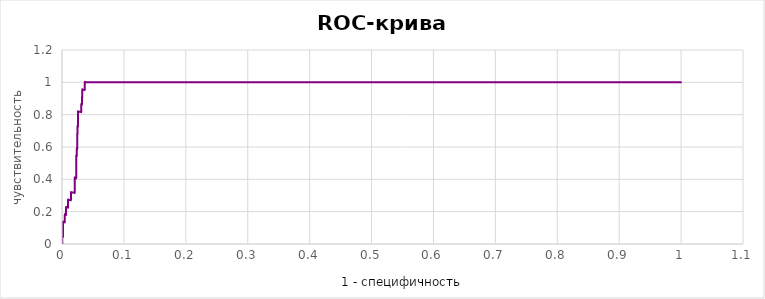
| Category | Series 0 |
|---|---|
| 0.00026595744680846245 | 0 |
| 0.0005319148936170359 | 0 |
| 0.0005319148936170359 | 0.045 |
| 0.0007978723404254984 | 0.045 |
| 0.0010638297872340718 | 0.045 |
| 0.0013297872340425343 | 0.045 |
| 0.0015957446808511078 | 0.045 |
| 0.0015957446808511078 | 0.091 |
| 0.0015957446808511078 | 0.136 |
| 0.0018617021276595702 | 0.136 |
| 0.0021276595744680327 | 0.136 |
| 0.002393617021276606 | 0.136 |
| 0.0026595744680850686 | 0.136 |
| 0.002925531914893642 | 0.136 |
| 0.0031914893617021045 | 0.136 |
| 0.003457446808510678 | 0.136 |
| 0.0037234042553191404 | 0.136 |
| 0.003989361702127714 | 0.136 |
| 0.004255319148936176 | 0.136 |
| 0.004521276595744639 | 0.136 |
| 0.004521276595744639 | 0.182 |
| 0.004787234042553212 | 0.182 |
| 0.005053191489361675 | 0.182 |
| 0.005319148936170248 | 0.182 |
| 0.005585106382978711 | 0.182 |
| 0.005851063829787284 | 0.182 |
| 0.006117021276595747 | 0.182 |
| 0.006382978723404209 | 0.182 |
| 0.0066489361702127825 | 0.182 |
| 0.0066489361702127825 | 0.227 |
| 0.006914893617021245 | 0.227 |
| 0.007180851063829818 | 0.227 |
| 0.007446808510638281 | 0.227 |
| 0.007712765957446854 | 0.227 |
| 0.007978723404255317 | 0.227 |
| 0.00824468085106378 | 0.227 |
| 0.008510638297872353 | 0.227 |
| 0.008776595744680815 | 0.227 |
| 0.009042553191489389 | 0.227 |
| 0.009308510638297851 | 0.227 |
| 0.009574468085106425 | 0.227 |
| 0.009840425531914887 | 0.227 |
| 0.009840425531914887 | 0.273 |
| 0.01010638297872335 | 0.273 |
| 0.010372340425531923 | 0.273 |
| 0.010638297872340385 | 0.273 |
| 0.010904255319148959 | 0.273 |
| 0.011170212765957421 | 0.273 |
| 0.011436170212765995 | 0.273 |
| 0.011702127659574457 | 0.273 |
| 0.01196808510638303 | 0.273 |
| 0.012234042553191493 | 0.273 |
| 0.012499999999999956 | 0.273 |
| 0.012765957446808529 | 0.273 |
| 0.013031914893616992 | 0.273 |
| 0.013297872340425565 | 0.273 |
| 0.013563829787234027 | 0.273 |
| 0.013829787234042601 | 0.273 |
| 0.014095744680851063 | 0.273 |
| 0.014361702127659526 | 0.273 |
| 0.014361702127659526 | 0.318 |
| 0.0146276595744681 | 0.318 |
| 0.014893617021276562 | 0.318 |
| 0.015159574468085135 | 0.318 |
| 0.015425531914893598 | 0.318 |
| 0.01569148936170217 | 0.318 |
| 0.015957446808510634 | 0.318 |
| 0.016223404255319096 | 0.318 |
| 0.01648936170212767 | 0.318 |
| 0.016755319148936132 | 0.318 |
| 0.017021276595744705 | 0.318 |
| 0.017287234042553168 | 0.318 |
| 0.01755319148936174 | 0.318 |
| 0.017819148936170204 | 0.318 |
| 0.018085106382978777 | 0.318 |
| 0.01835106382978724 | 0.318 |
| 0.018617021276595702 | 0.318 |
| 0.018882978723404276 | 0.318 |
| 0.019148936170212738 | 0.318 |
| 0.01941489361702131 | 0.318 |
| 0.019680851063829774 | 0.318 |
| 0.019946808510638347 | 0.318 |
| 0.02021276595744681 | 0.318 |
| 0.020478723404255272 | 0.318 |
| 0.020478723404255272 | 0.364 |
| 0.020478723404255272 | 0.409 |
| 0.020744680851063846 | 0.409 |
| 0.02101063829787231 | 0.409 |
| 0.021276595744680882 | 0.409 |
| 0.021542553191489344 | 0.409 |
| 0.021808510638297918 | 0.409 |
| 0.02207446808510638 | 0.409 |
| 0.022340425531914843 | 0.409 |
| 0.022606382978723416 | 0.409 |
| 0.02287234042553188 | 0.409 |
| 0.02287234042553188 | 0.455 |
| 0.02287234042553188 | 0.5 |
| 0.02287234042553188 | 0.545 |
| 0.023138297872340452 | 0.545 |
| 0.023404255319148914 | 0.545 |
| 0.023670212765957488 | 0.545 |
| 0.02393617021276595 | 0.545 |
| 0.02393617021276595 | 0.591 |
| 0.024202127659574413 | 0.591 |
| 0.024468085106382986 | 0.591 |
| 0.02473404255319145 | 0.591 |
| 0.02473404255319145 | 0.636 |
| 0.02473404255319145 | 0.682 |
| 0.025000000000000022 | 0.682 |
| 0.025000000000000022 | 0.727 |
| 0.025265957446808485 | 0.727 |
| 0.025531914893617058 | 0.727 |
| 0.02579787234042552 | 0.727 |
| 0.02579787234042552 | 0.773 |
| 0.02579787234042552 | 0.818 |
| 0.026063829787234094 | 0.818 |
| 0.026329787234042556 | 0.818 |
| 0.02659574468085102 | 0.818 |
| 0.026861702127659592 | 0.818 |
| 0.027127659574468055 | 0.818 |
| 0.02739361702127663 | 0.818 |
| 0.02765957446808509 | 0.818 |
| 0.027925531914893664 | 0.818 |
| 0.028191489361702127 | 0.818 |
| 0.02845744680851059 | 0.818 |
| 0.028723404255319163 | 0.818 |
| 0.028989361702127625 | 0.818 |
| 0.0292553191489362 | 0.818 |
| 0.02952127659574466 | 0.818 |
| 0.029787234042553234 | 0.818 |
| 0.030053191489361697 | 0.818 |
| 0.03031914893617016 | 0.818 |
| 0.030585106382978733 | 0.818 |
| 0.030851063829787195 | 0.818 |
| 0.03111702127659577 | 0.818 |
| 0.03111702127659577 | 0.864 |
| 0.03138297872340423 | 0.864 |
| 0.031648936170212805 | 0.864 |
| 0.03191489361702127 | 0.864 |
| 0.03218085106382984 | 0.864 |
| 0.03218085106382984 | 0.909 |
| 0.0324468085106383 | 0.909 |
| 0.032712765957446766 | 0.909 |
| 0.032712765957446766 | 0.955 |
| 0.03297872340425534 | 0.955 |
| 0.0332446808510638 | 0.955 |
| 0.033510638297872375 | 0.955 |
| 0.03377659574468084 | 0.955 |
| 0.03404255319148941 | 0.955 |
| 0.03430851063829787 | 0.955 |
| 0.034574468085106336 | 0.955 |
| 0.03484042553191491 | 0.955 |
| 0.03510638297872337 | 0.955 |
| 0.035372340425531945 | 0.955 |
| 0.03563829787234041 | 0.955 |
| 0.03590425531914898 | 0.955 |
| 0.036170212765957444 | 0.955 |
| 0.036436170212765906 | 0.955 |
| 0.03670212765957448 | 0.955 |
| 0.03670212765957448 | 1 |
| 0.03696808510638294 | 1 |
| 0.037234042553191515 | 1 |
| 0.03749999999999998 | 1 |
| 0.03776595744680855 | 1 |
| 0.038031914893617014 | 1 |
| 0.03829787234042559 | 1 |
| 0.03856382978723405 | 1 |
| 0.03882978723404251 | 1 |
| 0.039095744680851086 | 1 |
| 0.03936170212765955 | 1 |
| 0.03962765957446812 | 1 |
| 0.039893617021276584 | 1 |
| 0.04015957446808516 | 1 |
| 0.04042553191489362 | 1 |
| 0.04069148936170208 | 1 |
| 0.040957446808510656 | 1 |
| 0.04122340425531912 | 1 |
| 0.04148936170212769 | 1 |
| 0.041755319148936154 | 1 |
| 0.04202127659574473 | 1 |
| 0.04228723404255319 | 1 |
| 0.04255319148936165 | 1 |
| 0.042819148936170226 | 1 |
| 0.04308510638297869 | 1 |
| 0.04335106382978726 | 1 |
| 0.043617021276595724 | 1 |
| 0.0438829787234043 | 1 |
| 0.04414893617021276 | 1 |
| 0.04441489361702122 | 1 |
| 0.044680851063829796 | 1 |
| 0.04494680851063826 | 1 |
| 0.04521276595744683 | 1 |
| 0.045478723404255295 | 1 |
| 0.04574468085106387 | 1 |
| 0.04601063829787233 | 1 |
| 0.046276595744680904 | 1 |
| 0.046542553191489366 | 1 |
| 0.04680851063829783 | 1 |
| 0.0470744680851064 | 1 |
| 0.047340425531914865 | 1 |
| 0.04760638297872344 | 1 |
| 0.0478723404255319 | 1 |
| 0.048138297872340474 | 1 |
| 0.04840425531914894 | 1 |
| 0.0486702127659574 | 1 |
| 0.04893617021276597 | 1 |
| 0.049202127659574435 | 1 |
| 0.04946808510638301 | 1 |
| 0.04973404255319147 | 1 |
| 0.050000000000000044 | 1 |
| 0.05026595744680851 | 1 |
| 0.05053191489361697 | 1 |
| 0.05079787234042554 | 1 |
| 0.051063829787234005 | 1 |
| 0.05132978723404258 | 1 |
| 0.05159574468085104 | 1 |
| 0.051861702127659615 | 1 |
| 0.05212765957446808 | 1 |
| 0.05239361702127665 | 1 |
| 0.05265957446808511 | 1 |
| 0.052925531914893575 | 1 |
| 0.05319148936170215 | 1 |
| 0.05345744680851061 | 1 |
| 0.053723404255319185 | 1 |
| 0.05398936170212765 | 1 |
| 0.05425531914893622 | 1 |
| 0.05452127659574468 | 1 |
| 0.054787234042553146 | 1 |
| 0.05505319148936172 | 1 |
| 0.05531914893617018 | 1 |
| 0.055585106382978755 | 1 |
| 0.05585106382978722 | 1 |
| 0.05611702127659579 | 1 |
| 0.05638297872340425 | 1 |
| 0.056648936170212716 | 1 |
| 0.05691489361702129 | 1 |
| 0.05718085106382975 | 1 |
| 0.057446808510638325 | 1 |
| 0.05771276595744679 | 1 |
| 0.05797872340425536 | 1 |
| 0.058244680851063824 | 1 |
| 0.058510638297872286 | 1 |
| 0.05877659574468086 | 1 |
| 0.05904255319148932 | 1 |
| 0.059308510638297895 | 1 |
| 0.05957446808510636 | 1 |
| 0.05984042553191493 | 1 |
| 0.060106382978723394 | 1 |
| 0.06037234042553197 | 1 |
| 0.06063829787234043 | 1 |
| 0.06090425531914889 | 1 |
| 0.061170212765957466 | 1 |
| 0.06143617021276593 | 1 |
| 0.0617021276595745 | 1 |
| 0.061968085106382964 | 1 |
| 0.06223404255319154 | 1 |
| 0.0625 | 1 |
| 0.06276595744680846 | 1 |
| 0.06303191489361704 | 1 |
| 0.0632978723404255 | 1 |
| 0.06356382978723407 | 1 |
| 0.06382978723404253 | 1 |
| 0.06409574468085111 | 1 |
| 0.06436170212765957 | 1 |
| 0.06462765957446803 | 1 |
| 0.0648936170212766 | 1 |
| 0.06515957446808507 | 1 |
| 0.06542553191489364 | 1 |
| 0.0656914893617021 | 1 |
| 0.06595744680851068 | 1 |
| 0.06622340425531914 | 1 |
| 0.06648936170212771 | 1 |
| 0.06675531914893618 | 1 |
| 0.06702127659574464 | 1 |
| 0.06728723404255321 | 1 |
| 0.06755319148936167 | 1 |
| 0.06781914893617025 | 1 |
| 0.06808510638297871 | 1 |
| 0.06835106382978728 | 1 |
| 0.06861702127659575 | 1 |
| 0.06888297872340421 | 1 |
| 0.06914893617021278 | 1 |
| 0.06941489361702124 | 1 |
| 0.06968085106382982 | 1 |
| 0.06994680851063828 | 1 |
| 0.07021276595744685 | 1 |
| 0.07047872340425532 | 1 |
| 0.07074468085106378 | 1 |
| 0.07101063829787235 | 1 |
| 0.07127659574468082 | 1 |
| 0.07154255319148939 | 1 |
| 0.07180851063829785 | 1 |
| 0.07207446808510642 | 1 |
| 0.07234042553191489 | 1 |
| 0.07260638297872335 | 1 |
| 0.07287234042553192 | 1 |
| 0.07313829787234039 | 1 |
| 0.07340425531914896 | 1 |
| 0.07367021276595742 | 1 |
| 0.073936170212766 | 1 |
| 0.07420212765957446 | 1 |
| 0.07446808510638303 | 1 |
| 0.0747340425531915 | 1 |
| 0.07499999999999996 | 1 |
| 0.07526595744680853 | 1 |
| 0.07553191489361699 | 1 |
| 0.07579787234042556 | 1 |
| 0.07606382978723403 | 1 |
| 0.0763297872340426 | 1 |
| 0.07659574468085106 | 1 |
| 0.07686170212765953 | 1 |
| 0.0771276595744681 | 1 |
| 0.07739361702127656 | 1 |
| 0.07765957446808514 | 1 |
| 0.0779255319148936 | 1 |
| 0.07819148936170217 | 1 |
| 0.07845744680851063 | 1 |
| 0.0787234042553191 | 1 |
| 0.07898936170212767 | 1 |
| 0.07925531914893613 | 1 |
| 0.0795212765957447 | 1 |
| 0.07978723404255317 | 1 |
| 0.08005319148936174 | 1 |
| 0.0803191489361702 | 1 |
| 0.08058510638297878 | 1 |
| 0.08085106382978724 | 1 |
| 0.0811170212765957 | 1 |
| 0.08138297872340428 | 1 |
| 0.08164893617021274 | 1 |
| 0.08191489361702131 | 1 |
| 0.08218085106382977 | 1 |
| 0.08244680851063835 | 1 |
| 0.08271276595744681 | 1 |
| 0.08297872340425527 | 1 |
| 0.08324468085106385 | 1 |
| 0.08351063829787231 | 1 |
| 0.08377659574468088 | 1 |
| 0.08404255319148934 | 1 |
| 0.08430851063829792 | 1 |
| 0.08457446808510638 | 1 |
| 0.08484042553191484 | 1 |
| 0.08510638297872342 | 1 |
| 0.08537234042553188 | 1 |
| 0.08563829787234045 | 1 |
| 0.08590425531914891 | 1 |
| 0.08617021276595749 | 1 |
| 0.08643617021276595 | 1 |
| 0.08670212765957441 | 1 |
| 0.08696808510638299 | 1 |
| 0.08723404255319145 | 1 |
| 0.08750000000000002 | 1 |
| 0.08776595744680848 | 1 |
| 0.08803191489361706 | 1 |
| 0.08829787234042552 | 1 |
| 0.0885638297872341 | 1 |
| 0.08882978723404256 | 1 |
| 0.08909574468085102 | 1 |
| 0.08936170212765959 | 1 |
| 0.08962765957446805 | 1 |
| 0.08989361702127663 | 1 |
| 0.09015957446808509 | 1 |
| 0.09042553191489366 | 1 |
| 0.09069148936170213 | 1 |
| 0.09095744680851059 | 1 |
| 0.09122340425531916 | 1 |
| 0.09148936170212763 | 1 |
| 0.0917553191489362 | 1 |
| 0.09202127659574466 | 1 |
| 0.09228723404255323 | 1 |
| 0.0925531914893617 | 1 |
| 0.09281914893617016 | 1 |
| 0.09308510638297873 | 1 |
| 0.0933510638297872 | 1 |
| 0.09361702127659577 | 1 |
| 0.09388297872340423 | 1 |
| 0.0941489361702128 | 1 |
| 0.09441489361702127 | 1 |
| 0.09468085106382984 | 1 |
| 0.0949468085106383 | 1 |
| 0.09521276595744677 | 1 |
| 0.09547872340425534 | 1 |
| 0.0957446808510638 | 1 |
| 0.09601063829787237 | 1 |
| 0.09627659574468084 | 1 |
| 0.09654255319148941 | 1 |
| 0.09680851063829787 | 1 |
| 0.09707446808510634 | 1 |
| 0.09734042553191491 | 1 |
| 0.09760638297872337 | 1 |
| 0.09787234042553195 | 1 |
| 0.09813829787234041 | 1 |
| 0.09840425531914898 | 1 |
| 0.09867021276595744 | 1 |
| 0.0989361702127659 | 1 |
| 0.09920212765957448 | 1 |
| 0.09946808510638294 | 1 |
| 0.09973404255319152 | 1 |
| 0.09999999999999998 | 1 |
| 0.10026595744680855 | 1 |
| 0.10053191489361701 | 1 |
| 0.10079787234042559 | 1 |
| 0.10106382978723405 | 1 |
| 0.10132978723404251 | 1 |
| 0.10159574468085109 | 1 |
| 0.10186170212765955 | 1 |
| 0.10212765957446812 | 1 |
| 0.10239361702127658 | 1 |
| 0.10265957446808516 | 1 |
| 0.10292553191489362 | 1 |
| 0.10319148936170208 | 1 |
| 0.10345744680851066 | 1 |
| 0.10372340425531912 | 1 |
| 0.10398936170212769 | 1 |
| 0.10425531914893615 | 1 |
| 0.10452127659574473 | 1 |
| 0.10478723404255319 | 1 |
| 0.10505319148936165 | 1 |
| 0.10531914893617023 | 1 |
| 0.10558510638297869 | 1 |
| 0.10585106382978726 | 1 |
| 0.10611702127659572 | 1 |
| 0.1063829787234043 | 1 |
| 0.10664893617021276 | 1 |
| 0.10691489361702122 | 1 |
| 0.1071808510638298 | 1 |
| 0.10744680851063826 | 1 |
| 0.10771276595744683 | 1 |
| 0.1079787234042553 | 1 |
| 0.10824468085106387 | 1 |
| 0.10851063829787233 | 1 |
| 0.1087765957446809 | 1 |
| 0.10904255319148937 | 1 |
| 0.10930851063829783 | 1 |
| 0.1095744680851064 | 1 |
| 0.10984042553191486 | 1 |
| 0.11010638297872344 | 1 |
| 0.1103723404255319 | 1 |
| 0.11063829787234047 | 1 |
| 0.11090425531914894 | 1 |
| 0.1111702127659574 | 1 |
| 0.11143617021276597 | 1 |
| 0.11170212765957444 | 1 |
| 0.11196808510638301 | 1 |
| 0.11223404255319147 | 1 |
| 0.11250000000000004 | 1 |
| 0.1127659574468085 | 1 |
| 0.11303191489361697 | 1 |
| 0.11329787234042554 | 1 |
| 0.113563829787234 | 1 |
| 0.11382978723404258 | 1 |
| 0.11409574468085104 | 1 |
| 0.11436170212765961 | 1 |
| 0.11462765957446808 | 1 |
| 0.11489361702127665 | 1 |
| 0.11515957446808511 | 1 |
| 0.11542553191489358 | 1 |
| 0.11569148936170215 | 1 |
| 0.11595744680851061 | 1 |
| 0.11622340425531918 | 1 |
| 0.11648936170212765 | 1 |
| 0.11675531914893622 | 1 |
| 0.11702127659574468 | 1 |
| 0.11728723404255315 | 1 |
| 0.11755319148936172 | 1 |
| 0.11781914893617018 | 1 |
| 0.11808510638297876 | 1 |
| 0.11835106382978722 | 1 |
| 0.11861702127659579 | 1 |
| 0.11888297872340425 | 1 |
| 0.11914893617021272 | 1 |
| 0.11941489361702129 | 1 |
| 0.11968085106382975 | 1 |
| 0.11994680851063833 | 1 |
| 0.12021276595744679 | 1 |
| 0.12047872340425536 | 1 |
| 0.12074468085106382 | 1 |
| 0.12101063829787229 | 1 |
| 0.12127659574468086 | 1 |
| 0.12154255319148932 | 1 |
| 0.1218085106382979 | 1 |
| 0.12207446808510636 | 1 |
| 0.12234042553191493 | 1 |
| 0.1226063829787234 | 1 |
| 0.12287234042553197 | 1 |
| 0.12313829787234043 | 1 |
| 0.12340425531914889 | 1 |
| 0.12367021276595747 | 1 |
| 0.12393617021276593 | 1 |
| 0.1242021276595745 | 1 |
| 0.12446808510638296 | 1 |
| 0.12473404255319154 | 1 |
| 0.125 | 1 |
| 0.12526595744680846 | 1 |
| 0.12553191489361704 | 1 |
| 0.1257978723404255 | 1 |
| 0.12606382978723407 | 1 |
| 0.12632978723404253 | 1 |
| 0.1265957446808511 | 1 |
| 0.12686170212765957 | 1 |
| 0.12712765957446803 | 1 |
| 0.1273936170212766 | 1 |
| 0.12765957446808507 | 1 |
| 0.12792553191489364 | 1 |
| 0.1281914893617021 | 1 |
| 0.12845744680851068 | 1 |
| 0.12872340425531914 | 1 |
| 0.12898936170212771 | 1 |
| 0.12925531914893618 | 1 |
| 0.12952127659574464 | 1 |
| 0.1297872340425532 | 1 |
| 0.13005319148936167 | 1 |
| 0.13031914893617025 | 1 |
| 0.1305851063829787 | 1 |
| 0.13085106382978728 | 1 |
| 0.13111702127659575 | 1 |
| 0.1313829787234042 | 1 |
| 0.13164893617021278 | 1 |
| 0.13191489361702124 | 1 |
| 0.13218085106382982 | 1 |
| 0.13244680851063828 | 1 |
| 0.13271276595744685 | 1 |
| 0.13297872340425532 | 1 |
| 0.13324468085106378 | 1 |
| 0.13351063829787235 | 1 |
| 0.13377659574468082 | 1 |
| 0.1340425531914894 | 1 |
| 0.13430851063829785 | 1 |
| 0.13457446808510642 | 1 |
| 0.1348404255319149 | 1 |
| 0.13510638297872335 | 1 |
| 0.13537234042553192 | 1 |
| 0.13563829787234039 | 1 |
| 0.13590425531914896 | 1 |
| 0.13617021276595742 | 1 |
| 0.136436170212766 | 1 |
| 0.13670212765957446 | 1 |
| 0.13696808510638303 | 1 |
| 0.1372340425531915 | 1 |
| 0.13749999999999996 | 1 |
| 0.13776595744680853 | 1 |
| 0.138031914893617 | 1 |
| 0.13829787234042556 | 1 |
| 0.13856382978723403 | 1 |
| 0.1388297872340426 | 1 |
| 0.13909574468085106 | 1 |
| 0.13936170212765953 | 1 |
| 0.1396276595744681 | 1 |
| 0.13989361702127656 | 1 |
| 0.14015957446808514 | 1 |
| 0.1404255319148936 | 1 |
| 0.14069148936170217 | 1 |
| 0.14095744680851063 | 1 |
| 0.1412234042553191 | 1 |
| 0.14148936170212767 | 1 |
| 0.14175531914893613 | 1 |
| 0.1420212765957447 | 1 |
| 0.14228723404255317 | 1 |
| 0.14255319148936174 | 1 |
| 0.1428191489361702 | 1 |
| 0.14308510638297878 | 1 |
| 0.14335106382978724 | 1 |
| 0.1436170212765957 | 1 |
| 0.14388297872340428 | 1 |
| 0.14414893617021274 | 1 |
| 0.1444148936170213 | 1 |
| 0.14468085106382977 | 1 |
| 0.14494680851063835 | 1 |
| 0.1452127659574468 | 1 |
| 0.14547872340425527 | 1 |
| 0.14574468085106385 | 1 |
| 0.1460106382978723 | 1 |
| 0.14627659574468088 | 1 |
| 0.14654255319148934 | 1 |
| 0.14680851063829792 | 1 |
| 0.14707446808510638 | 1 |
| 0.14734042553191484 | 1 |
| 0.14760638297872342 | 1 |
| 0.14787234042553188 | 1 |
| 0.14813829787234045 | 1 |
| 0.14840425531914891 | 1 |
| 0.1486702127659575 | 1 |
| 0.14893617021276595 | 1 |
| 0.1492021276595744 | 1 |
| 0.149468085106383 | 1 |
| 0.14973404255319145 | 1 |
| 0.15000000000000002 | 1 |
| 0.15026595744680848 | 1 |
| 0.15053191489361706 | 1 |
| 0.15079787234042552 | 1 |
| 0.1510638297872341 | 1 |
| 0.15132978723404256 | 1 |
| 0.15159574468085102 | 1 |
| 0.1518617021276596 | 1 |
| 0.15212765957446805 | 1 |
| 0.15239361702127663 | 1 |
| 0.1526595744680851 | 1 |
| 0.15292553191489366 | 1 |
| 0.15319148936170213 | 1 |
| 0.1534574468085106 | 1 |
| 0.15372340425531916 | 1 |
| 0.15398936170212763 | 1 |
| 0.1542553191489362 | 1 |
| 0.15452127659574466 | 1 |
| 0.15478723404255323 | 1 |
| 0.1550531914893617 | 1 |
| 0.15531914893617016 | 1 |
| 0.15558510638297873 | 1 |
| 0.1558510638297872 | 1 |
| 0.15611702127659577 | 1 |
| 0.15638297872340423 | 1 |
| 0.1566489361702128 | 1 |
| 0.15691489361702127 | 1 |
| 0.15718085106382984 | 1 |
| 0.1574468085106383 | 1 |
| 0.15771276595744677 | 1 |
| 0.15797872340425534 | 1 |
| 0.1582446808510638 | 1 |
| 0.15851063829787237 | 1 |
| 0.15877659574468084 | 1 |
| 0.1590425531914894 | 1 |
| 0.15930851063829787 | 1 |
| 0.15957446808510634 | 1 |
| 0.1598404255319149 | 1 |
| 0.16010638297872337 | 1 |
| 0.16037234042553195 | 1 |
| 0.1606382978723404 | 1 |
| 0.16090425531914898 | 1 |
| 0.16117021276595744 | 1 |
| 0.1614361702127659 | 1 |
| 0.16170212765957448 | 1 |
| 0.16196808510638294 | 1 |
| 0.16223404255319152 | 1 |
| 0.16249999999999998 | 1 |
| 0.16276595744680855 | 1 |
| 0.163031914893617 | 1 |
| 0.1632978723404256 | 1 |
| 0.16356382978723405 | 1 |
| 0.1638297872340425 | 1 |
| 0.16409574468085109 | 1 |
| 0.16436170212765955 | 1 |
| 0.16462765957446812 | 1 |
| 0.16489361702127658 | 1 |
| 0.16515957446808516 | 1 |
| 0.16542553191489362 | 1 |
| 0.16569148936170208 | 1 |
| 0.16595744680851066 | 1 |
| 0.16622340425531912 | 1 |
| 0.1664893617021277 | 1 |
| 0.16675531914893615 | 1 |
| 0.16702127659574473 | 1 |
| 0.1672872340425532 | 1 |
| 0.16755319148936165 | 1 |
| 0.16781914893617023 | 1 |
| 0.1680851063829787 | 1 |
| 0.16835106382978726 | 1 |
| 0.16861702127659572 | 1 |
| 0.1688829787234043 | 1 |
| 0.16914893617021276 | 1 |
| 0.16941489361702122 | 1 |
| 0.1696808510638298 | 1 |
| 0.16994680851063826 | 1 |
| 0.17021276595744683 | 1 |
| 0.1704787234042553 | 1 |
| 0.17074468085106387 | 1 |
| 0.17101063829787233 | 1 |
| 0.1712765957446809 | 1 |
| 0.17154255319148937 | 1 |
| 0.17180851063829783 | 1 |
| 0.1720744680851064 | 1 |
| 0.17234042553191486 | 1 |
| 0.17260638297872344 | 1 |
| 0.1728723404255319 | 1 |
| 0.17313829787234047 | 1 |
| 0.17340425531914894 | 1 |
| 0.1736702127659574 | 1 |
| 0.17393617021276597 | 1 |
| 0.17420212765957444 | 1 |
| 0.174468085106383 | 1 |
| 0.17473404255319147 | 1 |
| 0.17500000000000004 | 1 |
| 0.1752659574468085 | 1 |
| 0.17553191489361697 | 1 |
| 0.17579787234042554 | 1 |
| 0.176063829787234 | 1 |
| 0.17632978723404258 | 1 |
| 0.17659574468085104 | 1 |
| 0.17686170212765961 | 1 |
| 0.17712765957446808 | 1 |
| 0.17739361702127665 | 1 |
| 0.1776595744680851 | 1 |
| 0.17792553191489358 | 1 |
| 0.17819148936170215 | 1 |
| 0.1784574468085106 | 1 |
| 0.17872340425531918 | 1 |
| 0.17898936170212765 | 1 |
| 0.17925531914893622 | 1 |
| 0.17952127659574468 | 1 |
| 0.17978723404255315 | 1 |
| 0.18005319148936172 | 1 |
| 0.18031914893617018 | 1 |
| 0.18058510638297876 | 1 |
| 0.18085106382978722 | 1 |
| 0.1811170212765958 | 1 |
| 0.18138297872340425 | 1 |
| 0.18164893617021272 | 1 |
| 0.1819148936170213 | 1 |
| 0.18218085106382975 | 1 |
| 0.18244680851063833 | 1 |
| 0.1827127659574468 | 1 |
| 0.18297872340425536 | 1 |
| 0.18324468085106382 | 1 |
| 0.18351063829787229 | 1 |
| 0.18377659574468086 | 1 |
| 0.18404255319148932 | 1 |
| 0.1843085106382979 | 1 |
| 0.18457446808510636 | 1 |
| 0.18484042553191493 | 1 |
| 0.1851063829787234 | 1 |
| 0.18537234042553197 | 1 |
| 0.18563829787234043 | 1 |
| 0.1859042553191489 | 1 |
| 0.18617021276595747 | 1 |
| 0.18643617021276593 | 1 |
| 0.1867021276595745 | 1 |
| 0.18696808510638296 | 1 |
| 0.18723404255319154 | 1 |
| 0.1875 | 1 |
| 0.18776595744680846 | 1 |
| 0.18803191489361704 | 1 |
| 0.1882978723404255 | 1 |
| 0.18856382978723407 | 1 |
| 0.18882978723404253 | 1 |
| 0.1890957446808511 | 1 |
| 0.18936170212765957 | 1 |
| 0.18962765957446803 | 1 |
| 0.1898936170212766 | 1 |
| 0.19015957446808507 | 1 |
| 0.19042553191489364 | 1 |
| 0.1906914893617021 | 1 |
| 0.19095744680851068 | 1 |
| 0.19122340425531914 | 1 |
| 0.19148936170212771 | 1 |
| 0.19175531914893618 | 1 |
| 0.19202127659574464 | 1 |
| 0.1922872340425532 | 1 |
| 0.19255319148936167 | 1 |
| 0.19281914893617025 | 1 |
| 0.1930851063829787 | 1 |
| 0.19335106382978728 | 1 |
| 0.19361702127659575 | 1 |
| 0.1938829787234042 | 1 |
| 0.19414893617021278 | 1 |
| 0.19441489361702124 | 1 |
| 0.19468085106382982 | 1 |
| 0.19494680851063828 | 1 |
| 0.19521276595744685 | 1 |
| 0.19547872340425532 | 1 |
| 0.19574468085106378 | 1 |
| 0.19601063829787235 | 1 |
| 0.19627659574468082 | 1 |
| 0.1965425531914894 | 1 |
| 0.19680851063829785 | 1 |
| 0.19707446808510642 | 1 |
| 0.1973404255319149 | 1 |
| 0.19760638297872335 | 1 |
| 0.19787234042553192 | 1 |
| 0.19813829787234039 | 1 |
| 0.19840425531914896 | 1 |
| 0.19867021276595742 | 1 |
| 0.198936170212766 | 1 |
| 0.19920212765957446 | 1 |
| 0.19946808510638303 | 1 |
| 0.1997340425531915 | 1 |
| 0.19999999999999996 | 1 |
| 0.20026595744680853 | 1 |
| 0.200531914893617 | 1 |
| 0.20079787234042556 | 1 |
| 0.20106382978723403 | 1 |
| 0.2013297872340426 | 1 |
| 0.20159574468085106 | 1 |
| 0.20186170212765953 | 1 |
| 0.2021276595744681 | 1 |
| 0.20239361702127656 | 1 |
| 0.20265957446808514 | 1 |
| 0.2029255319148936 | 1 |
| 0.20319148936170217 | 1 |
| 0.20345744680851063 | 1 |
| 0.2037234042553191 | 1 |
| 0.20398936170212767 | 1 |
| 0.20425531914893613 | 1 |
| 0.2045212765957447 | 1 |
| 0.20478723404255317 | 1 |
| 0.20505319148936174 | 1 |
| 0.2053191489361702 | 1 |
| 0.20558510638297878 | 1 |
| 0.20585106382978724 | 1 |
| 0.2061170212765957 | 1 |
| 0.20638297872340428 | 1 |
| 0.20664893617021274 | 1 |
| 0.2069148936170213 | 1 |
| 0.20718085106382977 | 1 |
| 0.20744680851063835 | 1 |
| 0.2077127659574468 | 1 |
| 0.20797872340425527 | 1 |
| 0.20824468085106385 | 1 |
| 0.2085106382978723 | 1 |
| 0.20877659574468088 | 1 |
| 0.20904255319148934 | 1 |
| 0.20930851063829792 | 1 |
| 0.20957446808510638 | 1 |
| 0.20984042553191484 | 1 |
| 0.21010638297872342 | 1 |
| 0.21037234042553188 | 1 |
| 0.21063829787234045 | 1 |
| 0.21090425531914891 | 1 |
| 0.2111702127659575 | 1 |
| 0.21143617021276595 | 1 |
| 0.2117021276595744 | 1 |
| 0.211968085106383 | 1 |
| 0.21223404255319145 | 1 |
| 0.21250000000000002 | 1 |
| 0.21276595744680848 | 1 |
| 0.21303191489361706 | 1 |
| 0.21329787234042552 | 1 |
| 0.2135638297872341 | 1 |
| 0.21382978723404256 | 1 |
| 0.21409574468085102 | 1 |
| 0.2143617021276596 | 1 |
| 0.21462765957446805 | 1 |
| 0.21489361702127663 | 1 |
| 0.2151595744680851 | 1 |
| 0.21542553191489366 | 1 |
| 0.21569148936170213 | 1 |
| 0.2159574468085106 | 1 |
| 0.21622340425531916 | 1 |
| 0.21648936170212763 | 1 |
| 0.2167553191489362 | 1 |
| 0.21702127659574466 | 1 |
| 0.21728723404255323 | 1 |
| 0.2175531914893617 | 1 |
| 0.21781914893617016 | 1 |
| 0.21808510638297873 | 1 |
| 0.2183510638297872 | 1 |
| 0.21861702127659577 | 1 |
| 0.21888297872340423 | 1 |
| 0.2191489361702128 | 1 |
| 0.21941489361702127 | 1 |
| 0.21968085106382984 | 1 |
| 0.2199468085106383 | 1 |
| 0.22021276595744677 | 1 |
| 0.22047872340425534 | 1 |
| 0.2207446808510638 | 1 |
| 0.22101063829787237 | 1 |
| 0.22127659574468084 | 1 |
| 0.2215425531914894 | 1 |
| 0.22180851063829787 | 1 |
| 0.22207446808510634 | 1 |
| 0.2223404255319149 | 1 |
| 0.22260638297872337 | 1 |
| 0.22287234042553195 | 1 |
| 0.2231382978723404 | 1 |
| 0.22340425531914898 | 1 |
| 0.22367021276595744 | 1 |
| 0.2239361702127659 | 1 |
| 0.22420212765957448 | 1 |
| 0.22446808510638294 | 1 |
| 0.22473404255319152 | 1 |
| 0.22499999999999998 | 1 |
| 0.22526595744680855 | 1 |
| 0.225531914893617 | 1 |
| 0.2257978723404256 | 1 |
| 0.22606382978723405 | 1 |
| 0.2263297872340425 | 1 |
| 0.22659574468085109 | 1 |
| 0.22686170212765955 | 1 |
| 0.22712765957446812 | 1 |
| 0.22739361702127658 | 1 |
| 0.22765957446808516 | 1 |
| 0.22792553191489362 | 1 |
| 0.22819148936170208 | 1 |
| 0.22845744680851066 | 1 |
| 0.22872340425531912 | 1 |
| 0.2289893617021277 | 1 |
| 0.22925531914893615 | 1 |
| 0.22952127659574473 | 1 |
| 0.2297872340425532 | 1 |
| 0.23005319148936165 | 1 |
| 0.23031914893617023 | 1 |
| 0.2305851063829787 | 1 |
| 0.23085106382978726 | 1 |
| 0.23111702127659572 | 1 |
| 0.2313829787234043 | 1 |
| 0.23164893617021276 | 1 |
| 0.23191489361702122 | 1 |
| 0.2321808510638298 | 1 |
| 0.23244680851063826 | 1 |
| 0.23271276595744683 | 1 |
| 0.2329787234042553 | 1 |
| 0.23324468085106387 | 1 |
| 0.23351063829787233 | 1 |
| 0.2337765957446809 | 1 |
| 0.23404255319148937 | 1 |
| 0.23430851063829783 | 1 |
| 0.2345744680851064 | 1 |
| 0.23484042553191486 | 1 |
| 0.23510638297872344 | 1 |
| 0.2353723404255319 | 1 |
| 0.23563829787234047 | 1 |
| 0.23590425531914894 | 1 |
| 0.2361702127659574 | 1 |
| 0.23643617021276597 | 1 |
| 0.23670212765957444 | 1 |
| 0.236968085106383 | 1 |
| 0.23723404255319147 | 1 |
| 0.23750000000000004 | 1 |
| 0.2377659574468085 | 1 |
| 0.23803191489361697 | 1 |
| 0.23829787234042554 | 1 |
| 0.238563829787234 | 1 |
| 0.23882978723404258 | 1 |
| 0.23909574468085104 | 1 |
| 0.23936170212765961 | 1 |
| 0.23962765957446808 | 1 |
| 0.23989361702127665 | 1 |
| 0.2401595744680851 | 1 |
| 0.24042553191489358 | 1 |
| 0.24069148936170215 | 1 |
| 0.2409574468085106 | 1 |
| 0.24122340425531918 | 1 |
| 0.24148936170212765 | 1 |
| 0.24175531914893622 | 1 |
| 0.24202127659574468 | 1 |
| 0.24228723404255315 | 1 |
| 0.24255319148936172 | 1 |
| 0.24281914893617018 | 1 |
| 0.24308510638297876 | 1 |
| 0.24335106382978722 | 1 |
| 0.2436170212765958 | 1 |
| 0.24388297872340425 | 1 |
| 0.24414893617021272 | 1 |
| 0.2444148936170213 | 1 |
| 0.24468085106382975 | 1 |
| 0.24494680851063833 | 1 |
| 0.2452127659574468 | 1 |
| 0.24547872340425536 | 1 |
| 0.24574468085106382 | 1 |
| 0.24601063829787229 | 1 |
| 0.24627659574468086 | 1 |
| 0.24654255319148932 | 1 |
| 0.2468085106382979 | 1 |
| 0.24707446808510636 | 1 |
| 0.24734042553191493 | 1 |
| 0.2476063829787234 | 1 |
| 0.24787234042553197 | 1 |
| 0.24813829787234043 | 1 |
| 0.2484042553191489 | 1 |
| 0.24867021276595747 | 1 |
| 0.24893617021276593 | 1 |
| 0.2492021276595745 | 1 |
| 0.24946808510638296 | 1 |
| 0.24973404255319154 | 1 |
| 0.25 | 1 |
| 0.25026595744680846 | 1 |
| 0.25053191489361704 | 1 |
| 0.2507978723404255 | 1 |
| 0.25106382978723407 | 1 |
| 0.25132978723404253 | 1 |
| 0.2515957446808511 | 1 |
| 0.25186170212765957 | 1 |
| 0.25212765957446803 | 1 |
| 0.2523936170212766 | 1 |
| 0.25265957446808507 | 1 |
| 0.25292553191489364 | 1 |
| 0.2531914893617021 | 1 |
| 0.2534574468085107 | 1 |
| 0.25372340425531914 | 1 |
| 0.2539893617021277 | 1 |
| 0.2542553191489362 | 1 |
| 0.25452127659574464 | 1 |
| 0.2547872340425532 | 1 |
| 0.2550531914893617 | 1 |
| 0.25531914893617025 | 1 |
| 0.2555851063829787 | 1 |
| 0.2558510638297873 | 1 |
| 0.25611702127659575 | 1 |
| 0.2563829787234042 | 1 |
| 0.2566489361702128 | 1 |
| 0.25691489361702124 | 1 |
| 0.2571808510638298 | 1 |
| 0.2574468085106383 | 1 |
| 0.25771276595744685 | 1 |
| 0.2579787234042553 | 1 |
| 0.2582446808510638 | 1 |
| 0.25851063829787235 | 1 |
| 0.2587765957446808 | 1 |
| 0.2590425531914894 | 1 |
| 0.25930851063829785 | 1 |
| 0.2595744680851064 | 1 |
| 0.2598404255319149 | 1 |
| 0.26010638297872335 | 1 |
| 0.2603723404255319 | 1 |
| 0.2606382978723404 | 1 |
| 0.26090425531914896 | 1 |
| 0.2611702127659574 | 1 |
| 0.261436170212766 | 1 |
| 0.26170212765957446 | 1 |
| 0.26196808510638303 | 1 |
| 0.2622340425531915 | 1 |
| 0.26249999999999996 | 1 |
| 0.26276595744680853 | 1 |
| 0.263031914893617 | 1 |
| 0.26329787234042556 | 1 |
| 0.263563829787234 | 1 |
| 0.2638297872340426 | 1 |
| 0.26409574468085106 | 1 |
| 0.2643617021276595 | 1 |
| 0.2646276595744681 | 1 |
| 0.26489361702127656 | 1 |
| 0.26515957446808514 | 1 |
| 0.2654255319148936 | 1 |
| 0.26569148936170217 | 1 |
| 0.26595744680851063 | 1 |
| 0.2662234042553191 | 1 |
| 0.26648936170212767 | 1 |
| 0.26675531914893613 | 1 |
| 0.2670212765957447 | 1 |
| 0.26728723404255317 | 1 |
| 0.26755319148936174 | 1 |
| 0.2678191489361702 | 1 |
| 0.2680851063829788 | 1 |
| 0.26835106382978724 | 1 |
| 0.2686170212765957 | 1 |
| 0.2688829787234043 | 1 |
| 0.26914893617021274 | 1 |
| 0.2694148936170213 | 1 |
| 0.2696808510638298 | 1 |
| 0.26994680851063835 | 1 |
| 0.2702127659574468 | 1 |
| 0.2704787234042553 | 1 |
| 0.27074468085106385 | 1 |
| 0.2710106382978723 | 1 |
| 0.2712765957446809 | 1 |
| 0.27154255319148934 | 1 |
| 0.2718085106382979 | 1 |
| 0.2720744680851064 | 1 |
| 0.27234042553191484 | 1 |
| 0.2726063829787234 | 1 |
| 0.2728723404255319 | 1 |
| 0.27313829787234045 | 1 |
| 0.2734042553191489 | 1 |
| 0.2736702127659575 | 1 |
| 0.27393617021276595 | 1 |
| 0.2742021276595744 | 1 |
| 0.274468085106383 | 1 |
| 0.27473404255319145 | 1 |
| 0.275 | 1 |
| 0.2752659574468085 | 1 |
| 0.27553191489361706 | 1 |
| 0.2757978723404255 | 1 |
| 0.2760638297872341 | 1 |
| 0.27632978723404256 | 1 |
| 0.276595744680851 | 1 |
| 0.2768617021276596 | 1 |
| 0.27712765957446805 | 1 |
| 0.27739361702127663 | 1 |
| 0.2776595744680851 | 1 |
| 0.27792553191489366 | 1 |
| 0.2781914893617021 | 1 |
| 0.2784574468085106 | 1 |
| 0.27872340425531916 | 1 |
| 0.2789893617021276 | 1 |
| 0.2792553191489362 | 1 |
| 0.27952127659574466 | 1 |
| 0.27978723404255323 | 1 |
| 0.2800531914893617 | 1 |
| 0.28031914893617016 | 1 |
| 0.28058510638297873 | 1 |
| 0.2808510638297872 | 1 |
| 0.28111702127659577 | 1 |
| 0.28138297872340423 | 1 |
| 0.2816489361702128 | 1 |
| 0.28191489361702127 | 1 |
| 0.28218085106382984 | 1 |
| 0.2824468085106383 | 1 |
| 0.28271276595744677 | 1 |
| 0.28297872340425534 | 1 |
| 0.2832446808510638 | 1 |
| 0.2835106382978724 | 1 |
| 0.28377659574468084 | 1 |
| 0.2840425531914894 | 1 |
| 0.2843085106382979 | 1 |
| 0.28457446808510634 | 1 |
| 0.2848404255319149 | 1 |
| 0.28510638297872337 | 1 |
| 0.28537234042553195 | 1 |
| 0.2856382978723404 | 1 |
| 0.285904255319149 | 1 |
| 0.28617021276595744 | 1 |
| 0.2864361702127659 | 1 |
| 0.2867021276595745 | 1 |
| 0.28696808510638294 | 1 |
| 0.2872340425531915 | 1 |
| 0.2875 | 1 |
| 0.28776595744680855 | 1 |
| 0.288031914893617 | 1 |
| 0.2882978723404256 | 1 |
| 0.28856382978723405 | 1 |
| 0.2888297872340425 | 1 |
| 0.2890957446808511 | 1 |
| 0.28936170212765955 | 1 |
| 0.2896276595744681 | 1 |
| 0.2898936170212766 | 1 |
| 0.29015957446808516 | 1 |
| 0.2904255319148936 | 1 |
| 0.2906914893617021 | 1 |
| 0.29095744680851066 | 1 |
| 0.2912234042553191 | 1 |
| 0.2914893617021277 | 1 |
| 0.29175531914893615 | 1 |
| 0.2920212765957447 | 1 |
| 0.2922872340425532 | 1 |
| 0.29255319148936165 | 1 |
| 0.2928191489361702 | 1 |
| 0.2930851063829787 | 1 |
| 0.29335106382978726 | 1 |
| 0.2936170212765957 | 1 |
| 0.2938829787234043 | 1 |
| 0.29414893617021276 | 1 |
| 0.2944148936170212 | 1 |
| 0.2946808510638298 | 1 |
| 0.29494680851063826 | 1 |
| 0.29521276595744683 | 1 |
| 0.2954787234042553 | 1 |
| 0.29574468085106387 | 1 |
| 0.29601063829787233 | 1 |
| 0.2962765957446809 | 1 |
| 0.29654255319148937 | 1 |
| 0.29680851063829783 | 1 |
| 0.2970744680851064 | 1 |
| 0.29734042553191486 | 1 |
| 0.29760638297872344 | 1 |
| 0.2978723404255319 | 1 |
| 0.2981382978723405 | 1 |
| 0.29840425531914894 | 1 |
| 0.2986702127659574 | 1 |
| 0.298936170212766 | 1 |
| 0.29920212765957444 | 1 |
| 0.299468085106383 | 1 |
| 0.29973404255319147 | 1 |
| 0.30000000000000004 | 1 |
| 0.3002659574468085 | 1 |
| 0.30053191489361697 | 1 |
| 0.30079787234042554 | 1 |
| 0.301063829787234 | 1 |
| 0.3013297872340426 | 1 |
| 0.30159574468085104 | 1 |
| 0.3018617021276596 | 1 |
| 0.3021276595744681 | 1 |
| 0.30239361702127665 | 1 |
| 0.3026595744680851 | 1 |
| 0.3029255319148936 | 1 |
| 0.30319148936170215 | 1 |
| 0.3034574468085106 | 1 |
| 0.3037234042553192 | 1 |
| 0.30398936170212765 | 1 |
| 0.3042553191489362 | 1 |
| 0.3045212765957447 | 1 |
| 0.30478723404255315 | 1 |
| 0.3050531914893617 | 1 |
| 0.3053191489361702 | 1 |
| 0.30558510638297876 | 1 |
| 0.3058510638297872 | 1 |
| 0.3061170212765958 | 1 |
| 0.30638297872340425 | 1 |
| 0.3066489361702127 | 1 |
| 0.3069148936170213 | 1 |
| 0.30718085106382975 | 1 |
| 0.3074468085106383 | 1 |
| 0.3077127659574468 | 1 |
| 0.30797872340425536 | 1 |
| 0.3082446808510638 | 1 |
| 0.3085106382978723 | 1 |
| 0.30877659574468086 | 1 |
| 0.3090425531914893 | 1 |
| 0.3093085106382979 | 1 |
| 0.30957446808510636 | 1 |
| 0.30984042553191493 | 1 |
| 0.3101063829787234 | 1 |
| 0.31037234042553197 | 1 |
| 0.31063829787234043 | 1 |
| 0.3109042553191489 | 1 |
| 0.31117021276595747 | 1 |
| 0.31143617021276593 | 1 |
| 0.3117021276595745 | 1 |
| 0.31196808510638296 | 1 |
| 0.31223404255319154 | 1 |
| 0.3125 | 1 |
| 0.31276595744680846 | 1 |
| 0.31303191489361704 | 1 |
| 0.3132978723404255 | 1 |
| 0.31356382978723407 | 1 |
| 0.31382978723404253 | 1 |
| 0.3140957446808511 | 1 |
| 0.31436170212765957 | 1 |
| 0.31462765957446803 | 1 |
| 0.3148936170212766 | 1 |
| 0.31515957446808507 | 1 |
| 0.31542553191489364 | 1 |
| 0.3156914893617021 | 1 |
| 0.3159574468085107 | 1 |
| 0.31622340425531914 | 1 |
| 0.3164893617021277 | 1 |
| 0.3167553191489362 | 1 |
| 0.31702127659574464 | 1 |
| 0.3172872340425532 | 1 |
| 0.3175531914893617 | 1 |
| 0.31781914893617025 | 1 |
| 0.3180851063829787 | 1 |
| 0.3183510638297873 | 1 |
| 0.31861702127659575 | 1 |
| 0.3188829787234042 | 1 |
| 0.3191489361702128 | 1 |
| 0.31941489361702124 | 1 |
| 0.3196808510638298 | 1 |
| 0.3199468085106383 | 1 |
| 0.32021276595744685 | 1 |
| 0.3204787234042553 | 1 |
| 0.3207446808510638 | 1 |
| 0.32101063829787235 | 1 |
| 0.3212765957446808 | 1 |
| 0.3215425531914894 | 1 |
| 0.32180851063829785 | 1 |
| 0.3220744680851064 | 1 |
| 0.3223404255319149 | 1 |
| 0.32260638297872335 | 1 |
| 0.3228723404255319 | 1 |
| 0.3231382978723404 | 1 |
| 0.32340425531914896 | 1 |
| 0.3236702127659574 | 1 |
| 0.323936170212766 | 1 |
| 0.32420212765957446 | 1 |
| 0.32446808510638303 | 1 |
| 0.3247340425531915 | 1 |
| 0.32499999999999996 | 1 |
| 0.32526595744680853 | 1 |
| 0.325531914893617 | 1 |
| 0.32579787234042556 | 1 |
| 0.326063829787234 | 1 |
| 0.3263297872340426 | 1 |
| 0.32659574468085106 | 1 |
| 0.3268617021276595 | 1 |
| 0.3271276595744681 | 1 |
| 0.32739361702127656 | 1 |
| 0.32765957446808514 | 1 |
| 0.3279255319148936 | 1 |
| 0.32819148936170217 | 1 |
| 0.32845744680851063 | 1 |
| 0.3287234042553191 | 1 |
| 0.32898936170212767 | 1 |
| 0.32925531914893613 | 1 |
| 0.3295212765957447 | 1 |
| 0.32978723404255317 | 1 |
| 0.33005319148936174 | 1 |
| 0.3303191489361702 | 1 |
| 0.3305851063829788 | 1 |
| 0.33085106382978724 | 1 |
| 0.3311170212765957 | 1 |
| 0.3313829787234043 | 1 |
| 0.33164893617021274 | 1 |
| 0.3319148936170213 | 1 |
| 0.3321808510638298 | 1 |
| 0.33244680851063835 | 1 |
| 0.3327127659574468 | 1 |
| 0.3329787234042553 | 1 |
| 0.33324468085106385 | 1 |
| 0.3335106382978723 | 1 |
| 0.3337765957446809 | 1 |
| 0.33404255319148934 | 1 |
| 0.3343085106382979 | 1 |
| 0.3345744680851064 | 1 |
| 0.33484042553191484 | 1 |
| 0.3351063829787234 | 1 |
| 0.3353723404255319 | 1 |
| 0.33563829787234045 | 1 |
| 0.3359042553191489 | 1 |
| 0.3361702127659575 | 1 |
| 0.33643617021276595 | 1 |
| 0.3367021276595744 | 1 |
| 0.336968085106383 | 1 |
| 0.33723404255319145 | 1 |
| 0.3375 | 1 |
| 0.3377659574468085 | 1 |
| 0.33803191489361706 | 1 |
| 0.3382978723404255 | 1 |
| 0.3385638297872341 | 1 |
| 0.33882978723404256 | 1 |
| 0.339095744680851 | 1 |
| 0.3393617021276596 | 1 |
| 0.33962765957446805 | 1 |
| 0.33989361702127663 | 1 |
| 0.3401595744680851 | 1 |
| 0.34042553191489366 | 1 |
| 0.3406914893617021 | 1 |
| 0.3409574468085106 | 1 |
| 0.34122340425531916 | 1 |
| 0.3414893617021276 | 1 |
| 0.3417553191489362 | 1 |
| 0.34202127659574466 | 1 |
| 0.34228723404255323 | 1 |
| 0.3425531914893617 | 1 |
| 0.34281914893617016 | 1 |
| 0.34308510638297873 | 1 |
| 0.3433510638297872 | 1 |
| 0.34361702127659577 | 1 |
| 0.34388297872340423 | 1 |
| 0.3441489361702128 | 1 |
| 0.34441489361702127 | 1 |
| 0.34468085106382984 | 1 |
| 0.3449468085106383 | 1 |
| 0.34521276595744677 | 1 |
| 0.34547872340425534 | 1 |
| 0.3457446808510638 | 1 |
| 0.3460106382978724 | 1 |
| 0.34627659574468084 | 1 |
| 0.3465425531914894 | 1 |
| 0.3468085106382979 | 1 |
| 0.34707446808510634 | 1 |
| 0.3473404255319149 | 1 |
| 0.34760638297872337 | 1 |
| 0.34787234042553195 | 1 |
| 0.3481382978723404 | 1 |
| 0.348404255319149 | 1 |
| 0.34867021276595744 | 1 |
| 0.3489361702127659 | 1 |
| 0.3492021276595745 | 1 |
| 0.34946808510638294 | 1 |
| 0.3497340425531915 | 1 |
| 0.35 | 1 |
| 0.35026595744680855 | 1 |
| 0.350531914893617 | 1 |
| 0.3507978723404256 | 1 |
| 0.35106382978723405 | 1 |
| 0.3513297872340425 | 1 |
| 0.3515957446808511 | 1 |
| 0.35186170212765955 | 1 |
| 0.3521276595744681 | 1 |
| 0.3523936170212766 | 1 |
| 0.35265957446808516 | 1 |
| 0.3529255319148936 | 1 |
| 0.3531914893617021 | 1 |
| 0.35345744680851066 | 1 |
| 0.3537234042553191 | 1 |
| 0.3539893617021277 | 1 |
| 0.35425531914893615 | 1 |
| 0.3545212765957447 | 1 |
| 0.3547872340425532 | 1 |
| 0.35505319148936165 | 1 |
| 0.3553191489361702 | 1 |
| 0.3555851063829787 | 1 |
| 0.35585106382978726 | 1 |
| 0.3561170212765957 | 1 |
| 0.3563829787234043 | 1 |
| 0.35664893617021276 | 1 |
| 0.3569148936170212 | 1 |
| 0.3571808510638298 | 1 |
| 0.35744680851063826 | 1 |
| 0.35771276595744683 | 1 |
| 0.3579787234042553 | 1 |
| 0.35824468085106387 | 1 |
| 0.35851063829787233 | 1 |
| 0.3587765957446809 | 1 |
| 0.35904255319148937 | 1 |
| 0.35930851063829783 | 1 |
| 0.3595744680851064 | 1 |
| 0.35984042553191486 | 1 |
| 0.36010638297872344 | 1 |
| 0.3603723404255319 | 1 |
| 0.3606382978723405 | 1 |
| 0.36090425531914894 | 1 |
| 0.3611702127659574 | 1 |
| 0.361436170212766 | 1 |
| 0.36170212765957444 | 1 |
| 0.361968085106383 | 1 |
| 0.36223404255319147 | 1 |
| 0.36250000000000004 | 1 |
| 0.3627659574468085 | 1 |
| 0.36303191489361697 | 1 |
| 0.36329787234042554 | 1 |
| 0.363563829787234 | 1 |
| 0.3638297872340426 | 1 |
| 0.36409574468085104 | 1 |
| 0.3643617021276596 | 1 |
| 0.3646276595744681 | 1 |
| 0.36489361702127665 | 1 |
| 0.3651595744680851 | 1 |
| 0.3654255319148936 | 1 |
| 0.36569148936170215 | 1 |
| 0.3659574468085106 | 1 |
| 0.3662234042553192 | 1 |
| 0.36648936170212765 | 1 |
| 0.3667553191489362 | 1 |
| 0.3670212765957447 | 1 |
| 0.36728723404255315 | 1 |
| 0.3675531914893617 | 1 |
| 0.3678191489361702 | 1 |
| 0.36808510638297876 | 1 |
| 0.3683510638297872 | 1 |
| 0.3686170212765958 | 1 |
| 0.36888297872340425 | 1 |
| 0.3691489361702127 | 1 |
| 0.3694148936170213 | 1 |
| 0.36968085106382975 | 1 |
| 0.3699468085106383 | 1 |
| 0.3702127659574468 | 1 |
| 0.37047872340425536 | 1 |
| 0.3707446808510638 | 1 |
| 0.3710106382978723 | 1 |
| 0.37127659574468086 | 1 |
| 0.3715425531914893 | 1 |
| 0.3718085106382979 | 1 |
| 0.37207446808510636 | 1 |
| 0.37234042553191493 | 1 |
| 0.3726063829787234 | 1 |
| 0.37287234042553197 | 1 |
| 0.37313829787234043 | 1 |
| 0.3734042553191489 | 1 |
| 0.37367021276595747 | 1 |
| 0.37393617021276593 | 1 |
| 0.3742021276595745 | 1 |
| 0.37446808510638296 | 1 |
| 0.37473404255319154 | 1 |
| 0.375 | 1 |
| 0.37526595744680846 | 1 |
| 0.37553191489361704 | 1 |
| 0.3757978723404255 | 1 |
| 0.37606382978723407 | 1 |
| 0.37632978723404253 | 1 |
| 0.3765957446808511 | 1 |
| 0.37686170212765957 | 1 |
| 0.37712765957446803 | 1 |
| 0.3773936170212766 | 1 |
| 0.37765957446808507 | 1 |
| 0.37792553191489364 | 1 |
| 0.3781914893617021 | 1 |
| 0.3784574468085107 | 1 |
| 0.37872340425531914 | 1 |
| 0.3789893617021277 | 1 |
| 0.3792553191489362 | 1 |
| 0.37952127659574464 | 1 |
| 0.3797872340425532 | 1 |
| 0.3800531914893617 | 1 |
| 0.38031914893617025 | 1 |
| 0.3805851063829787 | 1 |
| 0.3808510638297873 | 1 |
| 0.38111702127659575 | 1 |
| 0.3813829787234042 | 1 |
| 0.3816489361702128 | 1 |
| 0.38191489361702124 | 1 |
| 0.3821808510638298 | 1 |
| 0.3824468085106383 | 1 |
| 0.38271276595744685 | 1 |
| 0.3829787234042553 | 1 |
| 0.3832446808510638 | 1 |
| 0.38351063829787235 | 1 |
| 0.3837765957446808 | 1 |
| 0.3840425531914894 | 1 |
| 0.38430851063829785 | 1 |
| 0.3845744680851064 | 1 |
| 0.3848404255319149 | 1 |
| 0.38510638297872335 | 1 |
| 0.3853723404255319 | 1 |
| 0.3856382978723404 | 1 |
| 0.38590425531914896 | 1 |
| 0.3861702127659574 | 1 |
| 0.386436170212766 | 1 |
| 0.38670212765957446 | 1 |
| 0.38696808510638303 | 1 |
| 0.3872340425531915 | 1 |
| 0.38749999999999996 | 1 |
| 0.38776595744680853 | 1 |
| 0.388031914893617 | 1 |
| 0.38829787234042556 | 1 |
| 0.388563829787234 | 1 |
| 0.3888297872340426 | 1 |
| 0.38909574468085106 | 1 |
| 0.3893617021276595 | 1 |
| 0.3896276595744681 | 1 |
| 0.38989361702127656 | 1 |
| 0.39015957446808514 | 1 |
| 0.3904255319148936 | 1 |
| 0.39069148936170217 | 1 |
| 0.39095744680851063 | 1 |
| 0.3912234042553191 | 1 |
| 0.39148936170212767 | 1 |
| 0.39175531914893613 | 1 |
| 0.3920212765957447 | 1 |
| 0.39228723404255317 | 1 |
| 0.39255319148936174 | 1 |
| 0.3928191489361702 | 1 |
| 0.3930851063829788 | 1 |
| 0.39335106382978724 | 1 |
| 0.3936170212765957 | 1 |
| 0.3938829787234043 | 1 |
| 0.39414893617021274 | 1 |
| 0.3944148936170213 | 1 |
| 0.3946808510638298 | 1 |
| 0.39494680851063835 | 1 |
| 0.3952127659574468 | 1 |
| 0.3954787234042553 | 1 |
| 0.39574468085106385 | 1 |
| 0.3960106382978723 | 1 |
| 0.3962765957446809 | 1 |
| 0.39654255319148934 | 1 |
| 0.3968085106382979 | 1 |
| 0.3970744680851064 | 1 |
| 0.39734042553191484 | 1 |
| 0.3976063829787234 | 1 |
| 0.3978723404255319 | 1 |
| 0.39813829787234045 | 1 |
| 0.3984042553191489 | 1 |
| 0.3986702127659575 | 1 |
| 0.39893617021276595 | 1 |
| 0.3992021276595744 | 1 |
| 0.399468085106383 | 1 |
| 0.39973404255319145 | 1 |
| 0.4 | 1 |
| 0.4002659574468085 | 1 |
| 0.40053191489361706 | 1 |
| 0.4007978723404255 | 1 |
| 0.4010638297872341 | 1 |
| 0.40132978723404256 | 1 |
| 0.401595744680851 | 1 |
| 0.4018617021276596 | 1 |
| 0.40212765957446805 | 1 |
| 0.40239361702127663 | 1 |
| 0.4026595744680851 | 1 |
| 0.40292553191489366 | 1 |
| 0.4031914893617021 | 1 |
| 0.4034574468085106 | 1 |
| 0.40372340425531916 | 1 |
| 0.4039893617021276 | 1 |
| 0.4042553191489362 | 1 |
| 0.40452127659574466 | 1 |
| 0.40478723404255323 | 1 |
| 0.4050531914893617 | 1 |
| 0.40531914893617016 | 1 |
| 0.40558510638297873 | 1 |
| 0.4058510638297872 | 1 |
| 0.40611702127659577 | 1 |
| 0.40638297872340423 | 1 |
| 0.4066489361702128 | 1 |
| 0.40691489361702127 | 1 |
| 0.40718085106382984 | 1 |
| 0.4074468085106383 | 1 |
| 0.40771276595744677 | 1 |
| 0.40797872340425534 | 1 |
| 0.4082446808510638 | 1 |
| 0.4085106382978724 | 1 |
| 0.40877659574468084 | 1 |
| 0.4090425531914894 | 1 |
| 0.4093085106382979 | 1 |
| 0.40957446808510634 | 1 |
| 0.4098404255319149 | 1 |
| 0.41010638297872337 | 1 |
| 0.41037234042553195 | 1 |
| 0.4106382978723404 | 1 |
| 0.410904255319149 | 1 |
| 0.41117021276595744 | 1 |
| 0.4114361702127659 | 1 |
| 0.4117021276595745 | 1 |
| 0.41196808510638294 | 1 |
| 0.4122340425531915 | 1 |
| 0.4125 | 1 |
| 0.41276595744680855 | 1 |
| 0.413031914893617 | 1 |
| 0.4132978723404256 | 1 |
| 0.41356382978723405 | 1 |
| 0.4138297872340425 | 1 |
| 0.4140957446808511 | 1 |
| 0.41436170212765955 | 1 |
| 0.4146276595744681 | 1 |
| 0.4148936170212766 | 1 |
| 0.41515957446808516 | 1 |
| 0.4154255319148936 | 1 |
| 0.4156914893617021 | 1 |
| 0.41595744680851066 | 1 |
| 0.4162234042553191 | 1 |
| 0.4164893617021277 | 1 |
| 0.41675531914893615 | 1 |
| 0.4170212765957447 | 1 |
| 0.4172872340425532 | 1 |
| 0.41755319148936165 | 1 |
| 0.4178191489361702 | 1 |
| 0.4180851063829787 | 1 |
| 0.41835106382978726 | 1 |
| 0.4186170212765957 | 1 |
| 0.4188829787234043 | 1 |
| 0.41914893617021276 | 1 |
| 0.4194148936170212 | 1 |
| 0.4196808510638298 | 1 |
| 0.41994680851063826 | 1 |
| 0.42021276595744683 | 1 |
| 0.4204787234042553 | 1 |
| 0.42074468085106387 | 1 |
| 0.42101063829787233 | 1 |
| 0.4212765957446809 | 1 |
| 0.42154255319148937 | 1 |
| 0.42180851063829783 | 1 |
| 0.4220744680851064 | 1 |
| 0.42234042553191486 | 1 |
| 0.42260638297872344 | 1 |
| 0.4228723404255319 | 1 |
| 0.4231382978723405 | 1 |
| 0.42340425531914894 | 1 |
| 0.4236702127659574 | 1 |
| 0.423936170212766 | 1 |
| 0.42420212765957444 | 1 |
| 0.424468085106383 | 1 |
| 0.42473404255319147 | 1 |
| 0.42500000000000004 | 1 |
| 0.4252659574468085 | 1 |
| 0.42553191489361697 | 1 |
| 0.42579787234042554 | 1 |
| 0.426063829787234 | 1 |
| 0.4263297872340426 | 1 |
| 0.42659574468085104 | 1 |
| 0.4268617021276596 | 1 |
| 0.4271276595744681 | 1 |
| 0.42739361702127665 | 1 |
| 0.4276595744680851 | 1 |
| 0.4279255319148936 | 1 |
| 0.42819148936170215 | 1 |
| 0.4284574468085106 | 1 |
| 0.4287234042553192 | 1 |
| 0.42898936170212765 | 1 |
| 0.4292553191489362 | 1 |
| 0.4295212765957447 | 1 |
| 0.42978723404255315 | 1 |
| 0.4300531914893617 | 1 |
| 0.4303191489361702 | 1 |
| 0.43058510638297876 | 1 |
| 0.4308510638297872 | 1 |
| 0.4311170212765958 | 1 |
| 0.43138297872340425 | 1 |
| 0.4316489361702127 | 1 |
| 0.4319148936170213 | 1 |
| 0.43218085106382975 | 1 |
| 0.4324468085106383 | 1 |
| 0.4327127659574468 | 1 |
| 0.43297872340425536 | 1 |
| 0.4332446808510638 | 1 |
| 0.4335106382978723 | 1 |
| 0.43377659574468086 | 1 |
| 0.4340425531914893 | 1 |
| 0.4343085106382979 | 1 |
| 0.43457446808510636 | 1 |
| 0.43484042553191493 | 1 |
| 0.4351063829787234 | 1 |
| 0.43537234042553197 | 1 |
| 0.43563829787234043 | 1 |
| 0.4359042553191489 | 1 |
| 0.43617021276595747 | 1 |
| 0.43643617021276593 | 1 |
| 0.4367021276595745 | 1 |
| 0.43696808510638296 | 1 |
| 0.43723404255319154 | 1 |
| 0.4375 | 1 |
| 0.43776595744680846 | 1 |
| 0.43803191489361704 | 1 |
| 0.4382978723404255 | 1 |
| 0.43856382978723407 | 1 |
| 0.43882978723404253 | 1 |
| 0.4390957446808511 | 1 |
| 0.43936170212765957 | 1 |
| 0.43962765957446803 | 1 |
| 0.4398936170212766 | 1 |
| 0.44015957446808507 | 1 |
| 0.44042553191489364 | 1 |
| 0.4406914893617021 | 1 |
| 0.4409574468085107 | 1 |
| 0.44122340425531914 | 1 |
| 0.4414893617021277 | 1 |
| 0.4417553191489362 | 1 |
| 0.44202127659574464 | 1 |
| 0.4422872340425532 | 1 |
| 0.4425531914893617 | 1 |
| 0.44281914893617025 | 1 |
| 0.4430851063829787 | 1 |
| 0.4433510638297873 | 1 |
| 0.44361702127659575 | 1 |
| 0.4438829787234042 | 1 |
| 0.4441489361702128 | 1 |
| 0.44441489361702124 | 1 |
| 0.4446808510638298 | 1 |
| 0.4449468085106383 | 1 |
| 0.44521276595744685 | 1 |
| 0.4454787234042553 | 1 |
| 0.4457446808510638 | 1 |
| 0.44601063829787235 | 1 |
| 0.4462765957446808 | 1 |
| 0.4465425531914894 | 1 |
| 0.44680851063829785 | 1 |
| 0.4470744680851064 | 1 |
| 0.4473404255319149 | 1 |
| 0.44760638297872335 | 1 |
| 0.4478723404255319 | 1 |
| 0.4481382978723404 | 1 |
| 0.44840425531914896 | 1 |
| 0.4486702127659574 | 1 |
| 0.448936170212766 | 1 |
| 0.44920212765957446 | 1 |
| 0.44946808510638303 | 1 |
| 0.4497340425531915 | 1 |
| 0.44999999999999996 | 1 |
| 0.45026595744680853 | 1 |
| 0.450531914893617 | 1 |
| 0.45079787234042556 | 1 |
| 0.451063829787234 | 1 |
| 0.4513297872340426 | 1 |
| 0.45159574468085106 | 1 |
| 0.4518617021276595 | 1 |
| 0.4521276595744681 | 1 |
| 0.45239361702127656 | 1 |
| 0.45265957446808514 | 1 |
| 0.4529255319148936 | 1 |
| 0.45319148936170217 | 1 |
| 0.45345744680851063 | 1 |
| 0.4537234042553191 | 1 |
| 0.45398936170212767 | 1 |
| 0.45425531914893613 | 1 |
| 0.4545212765957447 | 1 |
| 0.45478723404255317 | 1 |
| 0.45505319148936174 | 1 |
| 0.4553191489361702 | 1 |
| 0.4555851063829788 | 1 |
| 0.45585106382978724 | 1 |
| 0.4561170212765957 | 1 |
| 0.4563829787234043 | 1 |
| 0.45664893617021274 | 1 |
| 0.4569148936170213 | 1 |
| 0.4571808510638298 | 1 |
| 0.45744680851063835 | 1 |
| 0.4577127659574468 | 1 |
| 0.4579787234042553 | 1 |
| 0.45824468085106385 | 1 |
| 0.4585106382978723 | 1 |
| 0.4587765957446809 | 1 |
| 0.45904255319148934 | 1 |
| 0.4593085106382979 | 1 |
| 0.4595744680851064 | 1 |
| 0.45984042553191484 | 1 |
| 0.4601063829787234 | 1 |
| 0.4603723404255319 | 1 |
| 0.46063829787234045 | 1 |
| 0.4609042553191489 | 1 |
| 0.4611702127659575 | 1 |
| 0.46143617021276595 | 1 |
| 0.4617021276595744 | 1 |
| 0.461968085106383 | 1 |
| 0.46223404255319145 | 1 |
| 0.4625 | 1 |
| 0.4627659574468085 | 1 |
| 0.46303191489361706 | 1 |
| 0.4632978723404255 | 1 |
| 0.4635638297872341 | 1 |
| 0.46382978723404256 | 1 |
| 0.464095744680851 | 1 |
| 0.4643617021276596 | 1 |
| 0.46462765957446805 | 1 |
| 0.46489361702127663 | 1 |
| 0.4651595744680851 | 1 |
| 0.46542553191489366 | 1 |
| 0.4656914893617021 | 1 |
| 0.4659574468085106 | 1 |
| 0.46622340425531916 | 1 |
| 0.4664893617021276 | 1 |
| 0.4667553191489362 | 1 |
| 0.46702127659574466 | 1 |
| 0.46728723404255323 | 1 |
| 0.4675531914893617 | 1 |
| 0.46781914893617016 | 1 |
| 0.46808510638297873 | 1 |
| 0.4683510638297872 | 1 |
| 0.46861702127659577 | 1 |
| 0.46888297872340423 | 1 |
| 0.4691489361702128 | 1 |
| 0.46941489361702127 | 1 |
| 0.46968085106382984 | 1 |
| 0.4699468085106383 | 1 |
| 0.47021276595744677 | 1 |
| 0.47047872340425534 | 1 |
| 0.4707446808510638 | 1 |
| 0.4710106382978724 | 1 |
| 0.47127659574468084 | 1 |
| 0.4715425531914894 | 1 |
| 0.4718085106382979 | 1 |
| 0.47207446808510634 | 1 |
| 0.4723404255319149 | 1 |
| 0.47260638297872337 | 1 |
| 0.47287234042553195 | 1 |
| 0.4731382978723404 | 1 |
| 0.473404255319149 | 1 |
| 0.47367021276595744 | 1 |
| 0.4739361702127659 | 1 |
| 0.4742021276595745 | 1 |
| 0.47446808510638294 | 1 |
| 0.4747340425531915 | 1 |
| 0.475 | 1 |
| 0.47526595744680855 | 1 |
| 0.475531914893617 | 1 |
| 0.4757978723404256 | 1 |
| 0.47606382978723405 | 1 |
| 0.4763297872340425 | 1 |
| 0.4765957446808511 | 1 |
| 0.47686170212765955 | 1 |
| 0.4771276595744681 | 1 |
| 0.4773936170212766 | 1 |
| 0.47765957446808516 | 1 |
| 0.4779255319148936 | 1 |
| 0.4781914893617021 | 1 |
| 0.47845744680851066 | 1 |
| 0.4787234042553191 | 1 |
| 0.4789893617021277 | 1 |
| 0.47925531914893615 | 1 |
| 0.4795212765957447 | 1 |
| 0.4797872340425532 | 1 |
| 0.48005319148936165 | 1 |
| 0.4803191489361702 | 1 |
| 0.4805851063829787 | 1 |
| 0.48085106382978726 | 1 |
| 0.4811170212765957 | 1 |
| 0.4813829787234043 | 1 |
| 0.48164893617021276 | 1 |
| 0.4819148936170212 | 1 |
| 0.4821808510638298 | 1 |
| 0.48244680851063826 | 1 |
| 0.48271276595744683 | 1 |
| 0.4829787234042553 | 1 |
| 0.48324468085106387 | 1 |
| 0.48351063829787233 | 1 |
| 0.4837765957446809 | 1 |
| 0.48404255319148937 | 1 |
| 0.48430851063829783 | 1 |
| 0.4845744680851064 | 1 |
| 0.48484042553191486 | 1 |
| 0.48510638297872344 | 1 |
| 0.4853723404255319 | 1 |
| 0.4856382978723405 | 1 |
| 0.48590425531914894 | 1 |
| 0.4861702127659574 | 1 |
| 0.486436170212766 | 1 |
| 0.48670212765957444 | 1 |
| 0.486968085106383 | 1 |
| 0.48723404255319147 | 1 |
| 0.48750000000000004 | 1 |
| 0.4877659574468085 | 1 |
| 0.48803191489361697 | 1 |
| 0.48829787234042554 | 1 |
| 0.488563829787234 | 1 |
| 0.4888297872340426 | 1 |
| 0.48909574468085104 | 1 |
| 0.4893617021276596 | 1 |
| 0.4896276595744681 | 1 |
| 0.48989361702127665 | 1 |
| 0.4901595744680851 | 1 |
| 0.4904255319148936 | 1 |
| 0.49069148936170215 | 1 |
| 0.4909574468085106 | 1 |
| 0.4912234042553192 | 1 |
| 0.49148936170212765 | 1 |
| 0.4917553191489362 | 1 |
| 0.4920212765957447 | 1 |
| 0.49228723404255315 | 1 |
| 0.4925531914893617 | 1 |
| 0.4928191489361702 | 1 |
| 0.49308510638297876 | 1 |
| 0.4933510638297872 | 1 |
| 0.4936170212765958 | 1 |
| 0.49388297872340425 | 1 |
| 0.4941489361702127 | 1 |
| 0.4944148936170213 | 1 |
| 0.49468085106382975 | 1 |
| 0.4949468085106383 | 1 |
| 0.4952127659574468 | 1 |
| 0.49547872340425536 | 1 |
| 0.4957446808510638 | 1 |
| 0.4960106382978723 | 1 |
| 0.49627659574468086 | 1 |
| 0.4965425531914893 | 1 |
| 0.4968085106382979 | 1 |
| 0.49707446808510636 | 1 |
| 0.49734042553191493 | 1 |
| 0.4976063829787234 | 1 |
| 0.49787234042553197 | 1 |
| 0.49813829787234043 | 1 |
| 0.4984042553191489 | 1 |
| 0.49867021276595747 | 1 |
| 0.49893617021276593 | 1 |
| 0.4992021276595745 | 1 |
| 0.49946808510638296 | 1 |
| 0.49973404255319154 | 1 |
| 0.5 | 1 |
| 0.5002659574468085 | 1 |
| 0.500531914893617 | 1 |
| 0.5007978723404256 | 1 |
| 0.5010638297872341 | 1 |
| 0.5013297872340425 | 1 |
| 0.501595744680851 | 1 |
| 0.5018617021276596 | 1 |
| 0.5021276595744681 | 1 |
| 0.5023936170212766 | 1 |
| 0.5026595744680851 | 1 |
| 0.5029255319148936 | 1 |
| 0.5031914893617021 | 1 |
| 0.5034574468085107 | 1 |
| 0.5037234042553191 | 1 |
| 0.5039893617021276 | 1 |
| 0.5042553191489362 | 1 |
| 0.5045212765957447 | 1 |
| 0.5047872340425532 | 1 |
| 0.5050531914893617 | 1 |
| 0.5053191489361701 | 1 |
| 0.5055851063829787 | 1 |
| 0.5058510638297873 | 1 |
| 0.5061170212765957 | 1 |
| 0.5063829787234042 | 1 |
| 0.5066489361702128 | 1 |
| 0.5069148936170214 | 1 |
| 0.5071808510638298 | 1 |
| 0.5074468085106383 | 1 |
| 0.5077127659574467 | 1 |
| 0.5079787234042553 | 1 |
| 0.5082446808510639 | 1 |
| 0.5085106382978724 | 1 |
| 0.5087765957446808 | 1 |
| 0.5090425531914894 | 1 |
| 0.5093085106382979 | 1 |
| 0.5095744680851064 | 1 |
| 0.5098404255319149 | 1 |
| 0.5101063829787233 | 1 |
| 0.5103723404255319 | 1 |
| 0.5106382978723405 | 1 |
| 0.510904255319149 | 1 |
| 0.5111702127659574 | 1 |
| 0.5114361702127659 | 1 |
| 0.5117021276595745 | 1 |
| 0.511968085106383 | 1 |
| 0.5122340425531915 | 1 |
| 0.5125 | 1 |
| 0.5127659574468085 | 1 |
| 0.5130319148936171 | 1 |
| 0.5132978723404256 | 1 |
| 0.513563829787234 | 1 |
| 0.5138297872340425 | 1 |
| 0.5140957446808511 | 1 |
| 0.5143617021276596 | 1 |
| 0.5146276595744681 | 1 |
| 0.5148936170212766 | 1 |
| 0.515159574468085 | 1 |
| 0.5154255319148936 | 1 |
| 0.5156914893617022 | 1 |
| 0.5159574468085106 | 1 |
| 0.5162234042553191 | 1 |
| 0.5164893617021277 | 1 |
| 0.5167553191489362 | 1 |
| 0.5170212765957447 | 1 |
| 0.5172872340425532 | 1 |
| 0.5175531914893616 | 1 |
| 0.5178191489361702 | 1 |
| 0.5180851063829788 | 1 |
| 0.5183510638297872 | 1 |
| 0.5186170212765957 | 1 |
| 0.5188829787234043 | 1 |
| 0.5191489361702128 | 1 |
| 0.5194148936170213 | 1 |
| 0.5196808510638298 | 1 |
| 0.5199468085106382 | 1 |
| 0.5202127659574468 | 1 |
| 0.5204787234042554 | 1 |
| 0.5207446808510638 | 1 |
| 0.5210106382978723 | 1 |
| 0.5212765957446808 | 1 |
| 0.5215425531914893 | 1 |
| 0.5218085106382979 | 1 |
| 0.5220744680851064 | 1 |
| 0.5223404255319148 | 1 |
| 0.5226063829787234 | 1 |
| 0.522872340425532 | 1 |
| 0.5231382978723405 | 1 |
| 0.5234042553191489 | 1 |
| 0.5236702127659574 | 1 |
| 0.523936170212766 | 1 |
| 0.5242021276595745 | 1 |
| 0.524468085106383 | 1 |
| 0.5247340425531914 | 1 |
| 0.525 | 1 |
| 0.5252659574468085 | 1 |
| 0.5255319148936171 | 1 |
| 0.5257978723404255 | 1 |
| 0.526063829787234 | 1 |
| 0.5263297872340426 | 1 |
| 0.5265957446808511 | 1 |
| 0.5268617021276596 | 1 |
| 0.527127659574468 | 1 |
| 0.5273936170212765 | 1 |
| 0.5276595744680851 | 1 |
| 0.5279255319148937 | 1 |
| 0.5281914893617021 | 1 |
| 0.5284574468085106 | 1 |
| 0.5287234042553192 | 1 |
| 0.5289893617021277 | 1 |
| 0.5292553191489362 | 1 |
| 0.5295212765957447 | 1 |
| 0.5297872340425531 | 1 |
| 0.5300531914893617 | 1 |
| 0.5303191489361703 | 1 |
| 0.5305851063829787 | 1 |
| 0.5308510638297872 | 1 |
| 0.5311170212765958 | 1 |
| 0.5313829787234042 | 1 |
| 0.5316489361702128 | 1 |
| 0.5319148936170213 | 1 |
| 0.5321808510638297 | 1 |
| 0.5324468085106383 | 1 |
| 0.5327127659574469 | 1 |
| 0.5329787234042553 | 1 |
| 0.5332446808510638 | 1 |
| 0.5335106382978723 | 1 |
| 0.5337765957446808 | 1 |
| 0.5340425531914894 | 1 |
| 0.5343085106382979 | 1 |
| 0.5345744680851063 | 1 |
| 0.5348404255319149 | 1 |
| 0.5351063829787235 | 1 |
| 0.535372340425532 | 1 |
| 0.5356382978723404 | 1 |
| 0.5359042553191489 | 1 |
| 0.5361702127659574 | 1 |
| 0.536436170212766 | 1 |
| 0.5367021276595745 | 1 |
| 0.5369680851063829 | 1 |
| 0.5372340425531915 | 1 |
| 0.5375 | 1 |
| 0.5377659574468086 | 1 |
| 0.538031914893617 | 1 |
| 0.5382978723404255 | 1 |
| 0.538563829787234 | 1 |
| 0.5388297872340426 | 1 |
| 0.5390957446808511 | 1 |
| 0.5393617021276595 | 1 |
| 0.539627659574468 | 1 |
| 0.5398936170212766 | 1 |
| 0.5401595744680852 | 1 |
| 0.5404255319148936 | 1 |
| 0.5406914893617021 | 1 |
| 0.5409574468085107 | 1 |
| 0.5412234042553192 | 1 |
| 0.5414893617021277 | 1 |
| 0.5417553191489362 | 1 |
| 0.5420212765957446 | 1 |
| 0.5422872340425532 | 1 |
| 0.5425531914893618 | 1 |
| 0.5428191489361702 | 1 |
| 0.5430851063829787 | 1 |
| 0.5433510638297872 | 1 |
| 0.5436170212765957 | 1 |
| 0.5438829787234043 | 1 |
| 0.5441489361702128 | 1 |
| 0.5444148936170212 | 1 |
| 0.5446808510638298 | 1 |
| 0.5449468085106384 | 1 |
| 0.5452127659574468 | 1 |
| 0.5454787234042553 | 1 |
| 0.5457446808510638 | 1 |
| 0.5460106382978723 | 1 |
| 0.5462765957446809 | 1 |
| 0.5465425531914894 | 1 |
| 0.5468085106382978 | 1 |
| 0.5470744680851064 | 1 |
| 0.547340425531915 | 1 |
| 0.5476063829787234 | 1 |
| 0.5478723404255319 | 1 |
| 0.5481382978723404 | 1 |
| 0.5484042553191489 | 1 |
| 0.5486702127659575 | 1 |
| 0.548936170212766 | 1 |
| 0.5492021276595744 | 1 |
| 0.5494680851063829 | 1 |
| 0.5497340425531915 | 1 |
| 0.55 | 1 |
| 0.5502659574468085 | 1 |
| 0.550531914893617 | 1 |
| 0.5507978723404255 | 1 |
| 0.5510638297872341 | 1 |
| 0.5513297872340426 | 1 |
| 0.551595744680851 | 1 |
| 0.5518617021276595 | 1 |
| 0.5521276595744681 | 1 |
| 0.5523936170212767 | 1 |
| 0.5526595744680851 | 1 |
| 0.5529255319148936 | 1 |
| 0.5531914893617021 | 1 |
| 0.5534574468085106 | 1 |
| 0.5537234042553192 | 1 |
| 0.5539893617021276 | 1 |
| 0.5542553191489361 | 1 |
| 0.5545212765957447 | 1 |
| 0.5547872340425533 | 1 |
| 0.5550531914893617 | 1 |
| 0.5553191489361702 | 1 |
| 0.5555851063829786 | 1 |
| 0.5558510638297872 | 1 |
| 0.5561170212765958 | 1 |
| 0.5563829787234043 | 1 |
| 0.5566489361702127 | 1 |
| 0.5569148936170213 | 1 |
| 0.5571808510638299 | 1 |
| 0.5574468085106383 | 1 |
| 0.5577127659574468 | 1 |
| 0.5579787234042553 | 1 |
| 0.5582446808510638 | 1 |
| 0.5585106382978724 | 1 |
| 0.5587765957446809 | 1 |
| 0.5590425531914893 | 1 |
| 0.5593085106382979 | 1 |
| 0.5595744680851064 | 1 |
| 0.5598404255319149 | 1 |
| 0.5601063829787234 | 1 |
| 0.5603723404255319 | 1 |
| 0.5606382978723404 | 1 |
| 0.560904255319149 | 1 |
| 0.5611702127659575 | 1 |
| 0.5614361702127659 | 1 |
| 0.5617021276595744 | 1 |
| 0.561968085106383 | 1 |
| 0.5622340425531915 | 1 |
| 0.5625 | 1 |
| 0.5627659574468085 | 1 |
| 0.563031914893617 | 1 |
| 0.5632978723404256 | 1 |
| 0.5635638297872341 | 1 |
| 0.5638297872340425 | 1 |
| 0.564095744680851 | 1 |
| 0.5643617021276596 | 1 |
| 0.5646276595744681 | 1 |
| 0.5648936170212766 | 1 |
| 0.5651595744680851 | 1 |
| 0.5654255319148936 | 1 |
| 0.5656914893617021 | 1 |
| 0.5659574468085107 | 1 |
| 0.5662234042553191 | 1 |
| 0.5664893617021276 | 1 |
| 0.5667553191489362 | 1 |
| 0.5670212765957447 | 1 |
| 0.5672872340425532 | 1 |
| 0.5675531914893617 | 1 |
| 0.5678191489361701 | 1 |
| 0.5680851063829787 | 1 |
| 0.5683510638297873 | 1 |
| 0.5686170212765957 | 1 |
| 0.5688829787234042 | 1 |
| 0.5691489361702128 | 1 |
| 0.5694148936170214 | 1 |
| 0.5696808510638298 | 1 |
| 0.5699468085106383 | 1 |
| 0.5702127659574467 | 1 |
| 0.5704787234042553 | 1 |
| 0.5707446808510639 | 1 |
| 0.5710106382978724 | 1 |
| 0.5712765957446808 | 1 |
| 0.5715425531914894 | 1 |
| 0.5718085106382979 | 1 |
| 0.5720744680851064 | 1 |
| 0.5723404255319149 | 1 |
| 0.5726063829787233 | 1 |
| 0.5728723404255319 | 1 |
| 0.5731382978723405 | 1 |
| 0.573404255319149 | 1 |
| 0.5736702127659574 | 1 |
| 0.5739361702127659 | 1 |
| 0.5742021276595745 | 1 |
| 0.574468085106383 | 1 |
| 0.5747340425531915 | 1 |
| 0.575 | 1 |
| 0.5752659574468085 | 1 |
| 0.5755319148936171 | 1 |
| 0.5757978723404256 | 1 |
| 0.576063829787234 | 1 |
| 0.5763297872340425 | 1 |
| 0.5765957446808511 | 1 |
| 0.5768617021276596 | 1 |
| 0.5771276595744681 | 1 |
| 0.5773936170212766 | 1 |
| 0.577659574468085 | 1 |
| 0.5779255319148936 | 1 |
| 0.5781914893617022 | 1 |
| 0.5784574468085106 | 1 |
| 0.5787234042553191 | 1 |
| 0.5789893617021277 | 1 |
| 0.5792553191489362 | 1 |
| 0.5795212765957447 | 1 |
| 0.5797872340425532 | 1 |
| 0.5800531914893616 | 1 |
| 0.5803191489361702 | 1 |
| 0.5805851063829788 | 1 |
| 0.5808510638297872 | 1 |
| 0.5811170212765957 | 1 |
| 0.5813829787234043 | 1 |
| 0.5816489361702128 | 1 |
| 0.5819148936170213 | 1 |
| 0.5821808510638298 | 1 |
| 0.5824468085106382 | 1 |
| 0.5827127659574468 | 1 |
| 0.5829787234042554 | 1 |
| 0.5832446808510638 | 1 |
| 0.5835106382978723 | 1 |
| 0.5837765957446808 | 1 |
| 0.5840425531914893 | 1 |
| 0.5843085106382979 | 1 |
| 0.5845744680851064 | 1 |
| 0.5848404255319148 | 1 |
| 0.5851063829787234 | 1 |
| 0.585372340425532 | 1 |
| 0.5856382978723405 | 1 |
| 0.5859042553191489 | 1 |
| 0.5861702127659574 | 1 |
| 0.586436170212766 | 1 |
| 0.5867021276595745 | 1 |
| 0.586968085106383 | 1 |
| 0.5872340425531914 | 1 |
| 0.5875 | 1 |
| 0.5877659574468085 | 1 |
| 0.5880319148936171 | 1 |
| 0.5882978723404255 | 1 |
| 0.588563829787234 | 1 |
| 0.5888297872340426 | 1 |
| 0.5890957446808511 | 1 |
| 0.5893617021276596 | 1 |
| 0.589627659574468 | 1 |
| 0.5898936170212765 | 1 |
| 0.5901595744680851 | 1 |
| 0.5904255319148937 | 1 |
| 0.5906914893617021 | 1 |
| 0.5909574468085106 | 1 |
| 0.5912234042553192 | 1 |
| 0.5914893617021277 | 1 |
| 0.5917553191489362 | 1 |
| 0.5920212765957447 | 1 |
| 0.5922872340425531 | 1 |
| 0.5925531914893617 | 1 |
| 0.5928191489361703 | 1 |
| 0.5930851063829787 | 1 |
| 0.5933510638297872 | 1 |
| 0.5936170212765958 | 1 |
| 0.5938829787234042 | 1 |
| 0.5941489361702128 | 1 |
| 0.5944148936170213 | 1 |
| 0.5946808510638297 | 1 |
| 0.5949468085106383 | 1 |
| 0.5952127659574469 | 1 |
| 0.5954787234042553 | 1 |
| 0.5957446808510638 | 1 |
| 0.5960106382978723 | 1 |
| 0.5962765957446808 | 1 |
| 0.5965425531914894 | 1 |
| 0.5968085106382979 | 1 |
| 0.5970744680851063 | 1 |
| 0.5973404255319149 | 1 |
| 0.5976063829787235 | 1 |
| 0.597872340425532 | 1 |
| 0.5981382978723404 | 1 |
| 0.5984042553191489 | 1 |
| 0.5986702127659574 | 1 |
| 0.598936170212766 | 1 |
| 0.5992021276595745 | 1 |
| 0.5994680851063829 | 1 |
| 0.5997340425531915 | 1 |
| 0.6 | 1 |
| 0.6002659574468086 | 1 |
| 0.600531914893617 | 1 |
| 0.6007978723404255 | 1 |
| 0.601063829787234 | 1 |
| 0.6013297872340426 | 1 |
| 0.6015957446808511 | 1 |
| 0.6018617021276595 | 1 |
| 0.602127659574468 | 1 |
| 0.6023936170212766 | 1 |
| 0.6026595744680852 | 1 |
| 0.6029255319148936 | 1 |
| 0.6031914893617021 | 1 |
| 0.6034574468085107 | 1 |
| 0.6037234042553192 | 1 |
| 0.6039893617021277 | 1 |
| 0.6042553191489362 | 1 |
| 0.6045212765957446 | 1 |
| 0.6047872340425532 | 1 |
| 0.6050531914893618 | 1 |
| 0.6053191489361702 | 1 |
| 0.6055851063829787 | 1 |
| 0.6058510638297872 | 1 |
| 0.6061170212765957 | 1 |
| 0.6063829787234043 | 1 |
| 0.6066489361702128 | 1 |
| 0.6069148936170212 | 1 |
| 0.6071808510638298 | 1 |
| 0.6074468085106384 | 1 |
| 0.6077127659574468 | 1 |
| 0.6079787234042553 | 1 |
| 0.6082446808510638 | 1 |
| 0.6085106382978723 | 1 |
| 0.6087765957446809 | 1 |
| 0.6090425531914894 | 1 |
| 0.6093085106382978 | 1 |
| 0.6095744680851064 | 1 |
| 0.609840425531915 | 1 |
| 0.6101063829787234 | 1 |
| 0.6103723404255319 | 1 |
| 0.6106382978723404 | 1 |
| 0.6109042553191489 | 1 |
| 0.6111702127659575 | 1 |
| 0.611436170212766 | 1 |
| 0.6117021276595744 | 1 |
| 0.6119680851063829 | 1 |
| 0.6122340425531915 | 1 |
| 0.6125 | 1 |
| 0.6127659574468085 | 1 |
| 0.613031914893617 | 1 |
| 0.6132978723404255 | 1 |
| 0.6135638297872341 | 1 |
| 0.6138297872340426 | 1 |
| 0.614095744680851 | 1 |
| 0.6143617021276595 | 1 |
| 0.6146276595744681 | 1 |
| 0.6148936170212767 | 1 |
| 0.6151595744680851 | 1 |
| 0.6154255319148936 | 1 |
| 0.6156914893617021 | 1 |
| 0.6159574468085106 | 1 |
| 0.6162234042553192 | 1 |
| 0.6164893617021276 | 1 |
| 0.6167553191489361 | 1 |
| 0.6170212765957447 | 1 |
| 0.6172872340425533 | 1 |
| 0.6175531914893617 | 1 |
| 0.6178191489361702 | 1 |
| 0.6180851063829786 | 1 |
| 0.6183510638297872 | 1 |
| 0.6186170212765958 | 1 |
| 0.6188829787234043 | 1 |
| 0.6191489361702127 | 1 |
| 0.6194148936170213 | 1 |
| 0.6196808510638299 | 1 |
| 0.6199468085106383 | 1 |
| 0.6202127659574468 | 1 |
| 0.6204787234042553 | 1 |
| 0.6207446808510638 | 1 |
| 0.6210106382978724 | 1 |
| 0.6212765957446809 | 1 |
| 0.6215425531914893 | 1 |
| 0.6218085106382979 | 1 |
| 0.6220744680851064 | 1 |
| 0.6223404255319149 | 1 |
| 0.6226063829787234 | 1 |
| 0.6228723404255319 | 1 |
| 0.6231382978723404 | 1 |
| 0.623404255319149 | 1 |
| 0.6236702127659575 | 1 |
| 0.6239361702127659 | 1 |
| 0.6242021276595744 | 1 |
| 0.624468085106383 | 1 |
| 0.6247340425531915 | 1 |
| 0.625 | 1 |
| 0.6252659574468085 | 1 |
| 0.625531914893617 | 1 |
| 0.6257978723404256 | 1 |
| 0.6260638297872341 | 1 |
| 0.6263297872340425 | 1 |
| 0.626595744680851 | 1 |
| 0.6268617021276596 | 1 |
| 0.6271276595744681 | 1 |
| 0.6273936170212766 | 1 |
| 0.6276595744680851 | 1 |
| 0.6279255319148936 | 1 |
| 0.6281914893617021 | 1 |
| 0.6284574468085107 | 1 |
| 0.6287234042553191 | 1 |
| 0.6289893617021276 | 1 |
| 0.6292553191489362 | 1 |
| 0.6295212765957447 | 1 |
| 0.6297872340425532 | 1 |
| 0.6300531914893617 | 1 |
| 0.6303191489361701 | 1 |
| 0.6305851063829787 | 1 |
| 0.6308510638297873 | 1 |
| 0.6311170212765957 | 1 |
| 0.6313829787234042 | 1 |
| 0.6316489361702128 | 1 |
| 0.6319148936170214 | 1 |
| 0.6321808510638298 | 1 |
| 0.6324468085106383 | 1 |
| 0.6327127659574467 | 1 |
| 0.6329787234042553 | 1 |
| 0.6332446808510639 | 1 |
| 0.6335106382978724 | 1 |
| 0.6337765957446808 | 1 |
| 0.6340425531914894 | 1 |
| 0.6343085106382979 | 1 |
| 0.6345744680851064 | 1 |
| 0.6348404255319149 | 1 |
| 0.6351063829787233 | 1 |
| 0.6353723404255319 | 1 |
| 0.6356382978723405 | 1 |
| 0.635904255319149 | 1 |
| 0.6361702127659574 | 1 |
| 0.6364361702127659 | 1 |
| 0.6367021276595745 | 1 |
| 0.636968085106383 | 1 |
| 0.6372340425531915 | 1 |
| 0.6375 | 1 |
| 0.6377659574468085 | 1 |
| 0.6380319148936171 | 1 |
| 0.6382978723404256 | 1 |
| 0.638563829787234 | 1 |
| 0.6388297872340425 | 1 |
| 0.6390957446808511 | 1 |
| 0.6393617021276596 | 1 |
| 0.6396276595744681 | 1 |
| 0.6398936170212766 | 1 |
| 0.640159574468085 | 1 |
| 0.6404255319148936 | 1 |
| 0.6406914893617022 | 1 |
| 0.6409574468085106 | 1 |
| 0.6412234042553191 | 1 |
| 0.6414893617021277 | 1 |
| 0.6417553191489362 | 1 |
| 0.6420212765957447 | 1 |
| 0.6422872340425532 | 1 |
| 0.6425531914893616 | 1 |
| 0.6428191489361702 | 1 |
| 0.6430851063829788 | 1 |
| 0.6433510638297872 | 1 |
| 0.6436170212765957 | 1 |
| 0.6438829787234043 | 1 |
| 0.6441489361702128 | 1 |
| 0.6444148936170213 | 1 |
| 0.6446808510638298 | 1 |
| 0.6449468085106382 | 1 |
| 0.6452127659574468 | 1 |
| 0.6454787234042554 | 1 |
| 0.6457446808510638 | 1 |
| 0.6460106382978723 | 1 |
| 0.6462765957446808 | 1 |
| 0.6465425531914893 | 1 |
| 0.6468085106382979 | 1 |
| 0.6470744680851064 | 1 |
| 0.6473404255319148 | 1 |
| 0.6476063829787234 | 1 |
| 0.647872340425532 | 1 |
| 0.6481382978723405 | 1 |
| 0.6484042553191489 | 1 |
| 0.6486702127659574 | 1 |
| 0.648936170212766 | 1 |
| 0.6492021276595745 | 1 |
| 0.649468085106383 | 1 |
| 0.6497340425531914 | 1 |
| 0.65 | 1 |
| 0.6502659574468085 | 1 |
| 0.6505319148936171 | 1 |
| 0.6507978723404255 | 1 |
| 0.651063829787234 | 1 |
| 0.6513297872340426 | 1 |
| 0.6515957446808511 | 1 |
| 0.6518617021276596 | 1 |
| 0.652127659574468 | 1 |
| 0.6523936170212765 | 1 |
| 0.6526595744680851 | 1 |
| 0.6529255319148937 | 1 |
| 0.6531914893617021 | 1 |
| 0.6534574468085106 | 1 |
| 0.6537234042553192 | 1 |
| 0.6539893617021277 | 1 |
| 0.6542553191489362 | 1 |
| 0.6545212765957447 | 1 |
| 0.6547872340425531 | 1 |
| 0.6550531914893617 | 1 |
| 0.6553191489361703 | 1 |
| 0.6555851063829787 | 1 |
| 0.6558510638297872 | 1 |
| 0.6561170212765958 | 1 |
| 0.6563829787234042 | 1 |
| 0.6566489361702128 | 1 |
| 0.6569148936170213 | 1 |
| 0.6571808510638297 | 1 |
| 0.6574468085106383 | 1 |
| 0.6577127659574469 | 1 |
| 0.6579787234042553 | 1 |
| 0.6582446808510638 | 1 |
| 0.6585106382978723 | 1 |
| 0.6587765957446808 | 1 |
| 0.6590425531914894 | 1 |
| 0.6593085106382979 | 1 |
| 0.6595744680851063 | 1 |
| 0.6598404255319149 | 1 |
| 0.6601063829787235 | 1 |
| 0.660372340425532 | 1 |
| 0.6606382978723404 | 1 |
| 0.6609042553191489 | 1 |
| 0.6611702127659574 | 1 |
| 0.661436170212766 | 1 |
| 0.6617021276595745 | 1 |
| 0.6619680851063829 | 1 |
| 0.6622340425531915 | 1 |
| 0.6625 | 1 |
| 0.6627659574468086 | 1 |
| 0.663031914893617 | 1 |
| 0.6632978723404255 | 1 |
| 0.663563829787234 | 1 |
| 0.6638297872340426 | 1 |
| 0.6640957446808511 | 1 |
| 0.6643617021276595 | 1 |
| 0.664627659574468 | 1 |
| 0.6648936170212766 | 1 |
| 0.6651595744680852 | 1 |
| 0.6654255319148936 | 1 |
| 0.6656914893617021 | 1 |
| 0.6659574468085107 | 1 |
| 0.6662234042553192 | 1 |
| 0.6664893617021277 | 1 |
| 0.6667553191489362 | 1 |
| 0.6670212765957446 | 1 |
| 0.6672872340425532 | 1 |
| 0.6675531914893618 | 1 |
| 0.6678191489361702 | 1 |
| 0.6680851063829787 | 1 |
| 0.6683510638297872 | 1 |
| 0.6686170212765957 | 1 |
| 0.6688829787234043 | 1 |
| 0.6691489361702128 | 1 |
| 0.6694148936170212 | 1 |
| 0.6696808510638298 | 1 |
| 0.6699468085106384 | 1 |
| 0.6702127659574468 | 1 |
| 0.6704787234042553 | 1 |
| 0.6707446808510638 | 1 |
| 0.6710106382978723 | 1 |
| 0.6712765957446809 | 1 |
| 0.6715425531914894 | 1 |
| 0.6718085106382978 | 1 |
| 0.6720744680851064 | 1 |
| 0.672340425531915 | 1 |
| 0.6726063829787234 | 1 |
| 0.6728723404255319 | 1 |
| 0.6731382978723404 | 1 |
| 0.6734042553191489 | 1 |
| 0.6736702127659575 | 1 |
| 0.673936170212766 | 1 |
| 0.6742021276595744 | 1 |
| 0.6744680851063829 | 1 |
| 0.6747340425531915 | 1 |
| 0.675 | 1 |
| 0.6752659574468085 | 1 |
| 0.675531914893617 | 1 |
| 0.6757978723404255 | 1 |
| 0.6760638297872341 | 1 |
| 0.6763297872340426 | 1 |
| 0.676595744680851 | 1 |
| 0.6768617021276595 | 1 |
| 0.6771276595744681 | 1 |
| 0.6773936170212767 | 1 |
| 0.6776595744680851 | 1 |
| 0.6779255319148936 | 1 |
| 0.6781914893617021 | 1 |
| 0.6784574468085106 | 1 |
| 0.6787234042553192 | 1 |
| 0.6789893617021276 | 1 |
| 0.6792553191489361 | 1 |
| 0.6795212765957447 | 1 |
| 0.6797872340425533 | 1 |
| 0.6800531914893617 | 1 |
| 0.6803191489361702 | 1 |
| 0.6805851063829786 | 1 |
| 0.6808510638297872 | 1 |
| 0.6811170212765958 | 1 |
| 0.6813829787234043 | 1 |
| 0.6816489361702127 | 1 |
| 0.6819148936170213 | 1 |
| 0.6821808510638299 | 1 |
| 0.6824468085106383 | 1 |
| 0.6827127659574468 | 1 |
| 0.6829787234042553 | 1 |
| 0.6832446808510638 | 1 |
| 0.6835106382978724 | 1 |
| 0.6837765957446809 | 1 |
| 0.6840425531914893 | 1 |
| 0.6843085106382979 | 1 |
| 0.6845744680851064 | 1 |
| 0.6848404255319149 | 1 |
| 0.6851063829787234 | 1 |
| 0.6853723404255319 | 1 |
| 0.6856382978723404 | 1 |
| 0.685904255319149 | 1 |
| 0.6861702127659575 | 1 |
| 0.6864361702127659 | 1 |
| 0.6867021276595744 | 1 |
| 0.686968085106383 | 1 |
| 0.6872340425531915 | 1 |
| 0.6875 | 1 |
| 0.6877659574468085 | 1 |
| 0.688031914893617 | 1 |
| 0.6882978723404256 | 1 |
| 0.6885638297872341 | 1 |
| 0.6888297872340425 | 1 |
| 0.689095744680851 | 1 |
| 0.6893617021276596 | 1 |
| 0.6896276595744681 | 1 |
| 0.6898936170212766 | 1 |
| 0.6901595744680851 | 1 |
| 0.6904255319148936 | 1 |
| 0.6906914893617021 | 1 |
| 0.6909574468085107 | 1 |
| 0.6912234042553191 | 1 |
| 0.6914893617021276 | 1 |
| 0.6917553191489362 | 1 |
| 0.6920212765957447 | 1 |
| 0.6922872340425532 | 1 |
| 0.6925531914893617 | 1 |
| 0.6928191489361701 | 1 |
| 0.6930851063829787 | 1 |
| 0.6933510638297873 | 1 |
| 0.6936170212765957 | 1 |
| 0.6938829787234042 | 1 |
| 0.6941489361702128 | 1 |
| 0.6944148936170214 | 1 |
| 0.6946808510638298 | 1 |
| 0.6949468085106383 | 1 |
| 0.6952127659574467 | 1 |
| 0.6954787234042553 | 1 |
| 0.6957446808510639 | 1 |
| 0.6960106382978724 | 1 |
| 0.6962765957446808 | 1 |
| 0.6965425531914894 | 1 |
| 0.6968085106382979 | 1 |
| 0.6970744680851064 | 1 |
| 0.6973404255319149 | 1 |
| 0.6976063829787233 | 1 |
| 0.6978723404255319 | 1 |
| 0.6981382978723405 | 1 |
| 0.698404255319149 | 1 |
| 0.6986702127659574 | 1 |
| 0.6989361702127659 | 1 |
| 0.6992021276595745 | 1 |
| 0.699468085106383 | 1 |
| 0.6997340425531915 | 1 |
| 0.7 | 1 |
| 0.7002659574468085 | 1 |
| 0.7005319148936171 | 1 |
| 0.7007978723404256 | 1 |
| 0.701063829787234 | 1 |
| 0.7013297872340425 | 1 |
| 0.7015957446808511 | 1 |
| 0.7018617021276596 | 1 |
| 0.7021276595744681 | 1 |
| 0.7023936170212766 | 1 |
| 0.702659574468085 | 1 |
| 0.7029255319148936 | 1 |
| 0.7031914893617022 | 1 |
| 0.7034574468085106 | 1 |
| 0.7037234042553191 | 1 |
| 0.7039893617021277 | 1 |
| 0.7042553191489362 | 1 |
| 0.7045212765957447 | 1 |
| 0.7047872340425532 | 1 |
| 0.7050531914893616 | 1 |
| 0.7053191489361702 | 1 |
| 0.7055851063829788 | 1 |
| 0.7058510638297872 | 1 |
| 0.7061170212765957 | 1 |
| 0.7063829787234043 | 1 |
| 0.7066489361702128 | 1 |
| 0.7069148936170213 | 1 |
| 0.7071808510638298 | 1 |
| 0.7074468085106382 | 1 |
| 0.7077127659574468 | 1 |
| 0.7079787234042554 | 1 |
| 0.7082446808510638 | 1 |
| 0.7085106382978723 | 1 |
| 0.7087765957446808 | 1 |
| 0.7090425531914893 | 1 |
| 0.7093085106382979 | 1 |
| 0.7095744680851064 | 1 |
| 0.7098404255319148 | 1 |
| 0.7101063829787234 | 1 |
| 0.710372340425532 | 1 |
| 0.7106382978723405 | 1 |
| 0.7109042553191489 | 1 |
| 0.7111702127659574 | 1 |
| 0.711436170212766 | 1 |
| 0.7117021276595745 | 1 |
| 0.711968085106383 | 1 |
| 0.7122340425531914 | 1 |
| 0.7125 | 1 |
| 0.7127659574468085 | 1 |
| 0.7130319148936171 | 1 |
| 0.7132978723404255 | 1 |
| 0.713563829787234 | 1 |
| 0.7138297872340426 | 1 |
| 0.7140957446808511 | 1 |
| 0.7143617021276596 | 1 |
| 0.714627659574468 | 1 |
| 0.7148936170212765 | 1 |
| 0.7151595744680851 | 1 |
| 0.7154255319148937 | 1 |
| 0.7156914893617021 | 1 |
| 0.7159574468085106 | 1 |
| 0.7162234042553192 | 1 |
| 0.7164893617021277 | 1 |
| 0.7167553191489362 | 1 |
| 0.7170212765957447 | 1 |
| 0.7172872340425531 | 1 |
| 0.7175531914893617 | 1 |
| 0.7178191489361703 | 1 |
| 0.7180851063829787 | 1 |
| 0.7183510638297872 | 1 |
| 0.7186170212765958 | 1 |
| 0.7188829787234042 | 1 |
| 0.7191489361702128 | 1 |
| 0.7194148936170213 | 1 |
| 0.7196808510638297 | 1 |
| 0.7199468085106383 | 1 |
| 0.7202127659574469 | 1 |
| 0.7204787234042553 | 1 |
| 0.7207446808510638 | 1 |
| 0.7210106382978723 | 1 |
| 0.7212765957446808 | 1 |
| 0.7215425531914894 | 1 |
| 0.7218085106382979 | 1 |
| 0.7220744680851063 | 1 |
| 0.7223404255319149 | 1 |
| 0.7226063829787235 | 1 |
| 0.722872340425532 | 1 |
| 0.7231382978723404 | 1 |
| 0.7234042553191489 | 1 |
| 0.7236702127659574 | 1 |
| 0.723936170212766 | 1 |
| 0.7242021276595745 | 1 |
| 0.7244680851063829 | 1 |
| 0.7247340425531915 | 1 |
| 0.725 | 1 |
| 0.7252659574468086 | 1 |
| 0.725531914893617 | 1 |
| 0.7257978723404255 | 1 |
| 0.726063829787234 | 1 |
| 0.7263297872340426 | 1 |
| 0.7265957446808511 | 1 |
| 0.7268617021276595 | 1 |
| 0.727127659574468 | 1 |
| 0.7273936170212766 | 1 |
| 0.7276595744680852 | 1 |
| 0.7279255319148936 | 1 |
| 0.7281914893617021 | 1 |
| 0.7284574468085107 | 1 |
| 0.7287234042553192 | 1 |
| 0.7289893617021277 | 1 |
| 0.7292553191489362 | 1 |
| 0.7295212765957446 | 1 |
| 0.7297872340425532 | 1 |
| 0.7300531914893618 | 1 |
| 0.7303191489361702 | 1 |
| 0.7305851063829787 | 1 |
| 0.7308510638297872 | 1 |
| 0.7311170212765957 | 1 |
| 0.7313829787234043 | 1 |
| 0.7316489361702128 | 1 |
| 0.7319148936170212 | 1 |
| 0.7321808510638298 | 1 |
| 0.7324468085106384 | 1 |
| 0.7327127659574468 | 1 |
| 0.7329787234042553 | 1 |
| 0.7332446808510638 | 1 |
| 0.7335106382978723 | 1 |
| 0.7337765957446809 | 1 |
| 0.7340425531914894 | 1 |
| 0.7343085106382978 | 1 |
| 0.7345744680851064 | 1 |
| 0.734840425531915 | 1 |
| 0.7351063829787234 | 1 |
| 0.7353723404255319 | 1 |
| 0.7356382978723404 | 1 |
| 0.7359042553191489 | 1 |
| 0.7361702127659575 | 1 |
| 0.736436170212766 | 1 |
| 0.7367021276595744 | 1 |
| 0.7369680851063829 | 1 |
| 0.7372340425531915 | 1 |
| 0.7375 | 1 |
| 0.7377659574468085 | 1 |
| 0.738031914893617 | 1 |
| 0.7382978723404255 | 1 |
| 0.7385638297872341 | 1 |
| 0.7388297872340426 | 1 |
| 0.739095744680851 | 1 |
| 0.7393617021276595 | 1 |
| 0.7396276595744681 | 1 |
| 0.7398936170212767 | 1 |
| 0.7401595744680851 | 1 |
| 0.7404255319148936 | 1 |
| 0.7406914893617021 | 1 |
| 0.7409574468085106 | 1 |
| 0.7412234042553192 | 1 |
| 0.7414893617021276 | 1 |
| 0.7417553191489361 | 1 |
| 0.7420212765957447 | 1 |
| 0.7422872340425533 | 1 |
| 0.7425531914893617 | 1 |
| 0.7428191489361702 | 1 |
| 0.7430851063829786 | 1 |
| 0.7433510638297872 | 1 |
| 0.7436170212765958 | 1 |
| 0.7438829787234043 | 1 |
| 0.7441489361702127 | 1 |
| 0.7444148936170213 | 1 |
| 0.7446808510638299 | 1 |
| 0.7449468085106383 | 1 |
| 0.7452127659574468 | 1 |
| 0.7454787234042553 | 1 |
| 0.7457446808510638 | 1 |
| 0.7460106382978724 | 1 |
| 0.7462765957446809 | 1 |
| 0.7465425531914893 | 1 |
| 0.7468085106382979 | 1 |
| 0.7470744680851064 | 1 |
| 0.7473404255319149 | 1 |
| 0.7476063829787234 | 1 |
| 0.7478723404255319 | 1 |
| 0.7481382978723404 | 1 |
| 0.748404255319149 | 1 |
| 0.7486702127659575 | 1 |
| 0.7489361702127659 | 1 |
| 0.7492021276595744 | 1 |
| 0.749468085106383 | 1 |
| 0.7497340425531915 | 1 |
| 0.75 | 1 |
| 0.7502659574468085 | 1 |
| 0.750531914893617 | 1 |
| 0.7507978723404255 | 1 |
| 0.7510638297872341 | 1 |
| 0.7513297872340425 | 1 |
| 0.751595744680851 | 1 |
| 0.7518617021276596 | 1 |
| 0.7521276595744681 | 1 |
| 0.7523936170212766 | 1 |
| 0.7526595744680851 | 1 |
| 0.7529255319148936 | 1 |
| 0.7531914893617021 | 1 |
| 0.7534574468085107 | 1 |
| 0.7537234042553191 | 1 |
| 0.7539893617021276 | 1 |
| 0.7542553191489362 | 1 |
| 0.7545212765957447 | 1 |
| 0.7547872340425532 | 1 |
| 0.7550531914893617 | 1 |
| 0.7553191489361702 | 1 |
| 0.7555851063829787 | 1 |
| 0.7558510638297873 | 1 |
| 0.7561170212765957 | 1 |
| 0.7563829787234042 | 1 |
| 0.7566489361702128 | 1 |
| 0.7569148936170212 | 1 |
| 0.7571808510638298 | 1 |
| 0.7574468085106383 | 1 |
| 0.7577127659574467 | 1 |
| 0.7579787234042553 | 1 |
| 0.7582446808510639 | 1 |
| 0.7585106382978724 | 1 |
| 0.7587765957446808 | 1 |
| 0.7590425531914894 | 1 |
| 0.7593085106382979 | 1 |
| 0.7595744680851064 | 1 |
| 0.7598404255319149 | 1 |
| 0.7601063829787233 | 1 |
| 0.7603723404255319 | 1 |
| 0.7606382978723404 | 1 |
| 0.760904255319149 | 1 |
| 0.7611702127659574 | 1 |
| 0.761436170212766 | 1 |
| 0.7617021276595745 | 1 |
| 0.761968085106383 | 1 |
| 0.7622340425531915 | 1 |
| 0.7625 | 1 |
| 0.7627659574468085 | 1 |
| 0.763031914893617 | 1 |
| 0.7632978723404256 | 1 |
| 0.763563829787234 | 1 |
| 0.7638297872340425 | 1 |
| 0.7640957446808511 | 1 |
| 0.7643617021276596 | 1 |
| 0.7646276595744681 | 1 |
| 0.7648936170212766 | 1 |
| 0.7651595744680851 | 1 |
| 0.7654255319148936 | 1 |
| 0.7656914893617022 | 1 |
| 0.7659574468085106 | 1 |
| 0.7662234042553191 | 1 |
| 0.7664893617021277 | 1 |
| 0.7667553191489361 | 1 |
| 0.7670212765957447 | 1 |
| 0.7672872340425532 | 1 |
| 0.7675531914893617 | 1 |
| 0.7678191489361702 | 1 |
| 0.7680851063829788 | 1 |
| 0.7683510638297872 | 1 |
| 0.7686170212765957 | 1 |
| 0.7688829787234043 | 1 |
| 0.7691489361702127 | 1 |
| 0.7694148936170213 | 1 |
| 0.7696808510638298 | 1 |
| 0.7699468085106382 | 1 |
| 0.7702127659574468 | 1 |
| 0.7704787234042554 | 1 |
| 0.7707446808510638 | 1 |
| 0.7710106382978723 | 1 |
| 0.7712765957446809 | 1 |
| 0.7715425531914893 | 1 |
| 0.7718085106382979 | 1 |
| 0.7720744680851064 | 1 |
| 0.7723404255319148 | 1 |
| 0.7726063829787234 | 1 |
| 0.7728723404255319 | 1 |
| 0.7731382978723405 | 1 |
| 0.7734042553191489 | 1 |
| 0.7736702127659575 | 1 |
| 0.773936170212766 | 1 |
| 0.7742021276595745 | 1 |
| 0.774468085106383 | 1 |
| 0.7747340425531914 | 1 |
| 0.775 | 1 |
| 0.7752659574468085 | 1 |
| 0.7755319148936171 | 1 |
| 0.7757978723404255 | 1 |
| 0.776063829787234 | 1 |
| 0.7763297872340426 | 1 |
| 0.7765957446808511 | 1 |
| 0.7768617021276596 | 1 |
| 0.777127659574468 | 1 |
| 0.7773936170212766 | 1 |
| 0.7776595744680851 | 1 |
| 0.7779255319148937 | 1 |
| 0.7781914893617021 | 1 |
| 0.7784574468085106 | 1 |
| 0.7787234042553192 | 1 |
| 0.7789893617021276 | 1 |
| 0.7792553191489362 | 1 |
| 0.7795212765957447 | 1 |
| 0.7797872340425531 | 1 |
| 0.7800531914893617 | 1 |
| 0.7803191489361703 | 1 |
| 0.7805851063829787 | 1 |
| 0.7808510638297872 | 1 |
| 0.7811170212765958 | 1 |
| 0.7813829787234042 | 1 |
| 0.7816489361702128 | 1 |
| 0.7819148936170213 | 1 |
| 0.7821808510638297 | 1 |
| 0.7824468085106383 | 1 |
| 0.7827127659574469 | 1 |
| 0.7829787234042553 | 1 |
| 0.7832446808510638 | 1 |
| 0.7835106382978724 | 1 |
| 0.7837765957446808 | 1 |
| 0.7840425531914894 | 1 |
| 0.7843085106382979 | 1 |
| 0.7845744680851063 | 1 |
| 0.7848404255319149 | 1 |
| 0.7851063829787234 | 1 |
| 0.785372340425532 | 1 |
| 0.7856382978723404 | 1 |
| 0.7859042553191489 | 1 |
| 0.7861702127659574 | 1 |
| 0.786436170212766 | 1 |
| 0.7867021276595745 | 1 |
| 0.7869680851063829 | 1 |
| 0.7872340425531915 | 1 |
| 0.7875 | 1 |
| 0.7877659574468086 | 1 |
| 0.788031914893617 | 1 |
| 0.7882978723404255 | 1 |
| 0.788563829787234 | 1 |
| 0.7888297872340425 | 1 |
| 0.7890957446808511 | 1 |
| 0.7893617021276595 | 1 |
| 0.7896276595744681 | 1 |
| 0.7898936170212766 | 1 |
| 0.7901595744680852 | 1 |
| 0.7904255319148936 | 1 |
| 0.7906914893617021 | 1 |
| 0.7909574468085107 | 1 |
| 0.7912234042553191 | 1 |
| 0.7914893617021277 | 1 |
| 0.7917553191489362 | 1 |
| 0.7920212765957446 | 1 |
| 0.7922872340425532 | 1 |
| 0.7925531914893618 | 1 |
| 0.7928191489361702 | 1 |
| 0.7930851063829787 | 1 |
| 0.7933510638297873 | 1 |
| 0.7936170212765957 | 1 |
| 0.7938829787234043 | 1 |
| 0.7941489361702128 | 1 |
| 0.7944148936170212 | 1 |
| 0.7946808510638298 | 1 |
| 0.7949468085106383 | 1 |
| 0.7952127659574468 | 1 |
| 0.7954787234042553 | 1 |
| 0.7957446808510639 | 1 |
| 0.7960106382978723 | 1 |
| 0.7962765957446809 | 1 |
| 0.7965425531914894 | 1 |
| 0.7968085106382978 | 1 |
| 0.7970744680851064 | 1 |
| 0.7973404255319149 | 1 |
| 0.7976063829787234 | 1 |
| 0.7978723404255319 | 1 |
| 0.7981382978723404 | 1 |
| 0.7984042553191489 | 1 |
| 0.7986702127659575 | 1 |
| 0.798936170212766 | 1 |
| 0.7992021276595744 | 1 |
| 0.799468085106383 | 1 |
| 0.7997340425531915 | 1 |
| 0.8 | 1 |
| 0.8002659574468085 | 1 |
| 0.800531914893617 | 1 |
| 0.8007978723404255 | 1 |
| 0.801063829787234 | 1 |
| 0.8013297872340426 | 1 |
| 0.801595744680851 | 1 |
| 0.8018617021276596 | 1 |
| 0.8021276595744681 | 1 |
| 0.8023936170212767 | 1 |
| 0.8026595744680851 | 1 |
| 0.8029255319148936 | 1 |
| 0.8031914893617021 | 1 |
| 0.8034574468085106 | 1 |
| 0.8037234042553192 | 1 |
| 0.8039893617021276 | 1 |
| 0.8042553191489361 | 1 |
| 0.8045212765957447 | 1 |
| 0.8047872340425533 | 1 |
| 0.8050531914893617 | 1 |
| 0.8053191489361702 | 1 |
| 0.8055851063829788 | 1 |
| 0.8058510638297872 | 1 |
| 0.8061170212765958 | 1 |
| 0.8063829787234043 | 1 |
| 0.8066489361702127 | 1 |
| 0.8069148936170213 | 1 |
| 0.8071808510638298 | 1 |
| 0.8074468085106383 | 1 |
| 0.8077127659574468 | 1 |
| 0.8079787234042553 | 1 |
| 0.8082446808510638 | 1 |
| 0.8085106382978724 | 1 |
| 0.8087765957446809 | 1 |
| 0.8090425531914893 | 1 |
| 0.8093085106382979 | 1 |
| 0.8095744680851064 | 1 |
| 0.8098404255319149 | 1 |
| 0.8101063829787234 | 1 |
| 0.8103723404255319 | 1 |
| 0.8106382978723404 | 1 |
| 0.810904255319149 | 1 |
| 0.8111702127659575 | 1 |
| 0.8114361702127659 | 1 |
| 0.8117021276595745 | 1 |
| 0.811968085106383 | 1 |
| 0.8122340425531915 | 1 |
| 0.8125 | 1 |
| 0.8127659574468085 | 1 |
| 0.813031914893617 | 1 |
| 0.8132978723404255 | 1 |
| 0.8135638297872341 | 1 |
| 0.8138297872340425 | 1 |
| 0.814095744680851 | 1 |
| 0.8143617021276596 | 1 |
| 0.8146276595744681 | 1 |
| 0.8148936170212766 | 1 |
| 0.8151595744680851 | 1 |
| 0.8154255319148936 | 1 |
| 0.8156914893617021 | 1 |
| 0.8159574468085107 | 1 |
| 0.8162234042553191 | 1 |
| 0.8164893617021276 | 1 |
| 0.8167553191489362 | 1 |
| 0.8170212765957447 | 1 |
| 0.8172872340425532 | 1 |
| 0.8175531914893617 | 1 |
| 0.8178191489361702 | 1 |
| 0.8180851063829787 | 1 |
| 0.8183510638297873 | 1 |
| 0.8186170212765957 | 1 |
| 0.8188829787234042 | 1 |
| 0.8191489361702128 | 1 |
| 0.8194148936170212 | 1 |
| 0.8196808510638298 | 1 |
| 0.8199468085106383 | 1 |
| 0.8202127659574467 | 1 |
| 0.8204787234042553 | 1 |
| 0.8207446808510639 | 1 |
| 0.8210106382978724 | 1 |
| 0.8212765957446808 | 1 |
| 0.8215425531914894 | 1 |
| 0.8218085106382979 | 1 |
| 0.8220744680851064 | 1 |
| 0.8223404255319149 | 1 |
| 0.8226063829787233 | 1 |
| 0.8228723404255319 | 1 |
| 0.8231382978723404 | 1 |
| 0.823404255319149 | 1 |
| 0.8236702127659574 | 1 |
| 0.823936170212766 | 1 |
| 0.8242021276595745 | 1 |
| 0.824468085106383 | 1 |
| 0.8247340425531915 | 1 |
| 0.825 | 1 |
| 0.8252659574468085 | 1 |
| 0.825531914893617 | 1 |
| 0.8257978723404256 | 1 |
| 0.826063829787234 | 1 |
| 0.8263297872340425 | 1 |
| 0.8265957446808511 | 1 |
| 0.8268617021276596 | 1 |
| 0.8271276595744681 | 1 |
| 0.8273936170212766 | 1 |
| 0.8276595744680851 | 1 |
| 0.8279255319148936 | 1 |
| 0.8281914893617022 | 1 |
| 0.8284574468085106 | 1 |
| 0.8287234042553191 | 1 |
| 0.8289893617021277 | 1 |
| 0.8292553191489361 | 1 |
| 0.8295212765957447 | 1 |
| 0.8297872340425532 | 1 |
| 0.8300531914893617 | 1 |
| 0.8303191489361702 | 1 |
| 0.8305851063829788 | 1 |
| 0.8308510638297872 | 1 |
| 0.8311170212765957 | 1 |
| 0.8313829787234043 | 1 |
| 0.8316489361702127 | 1 |
| 0.8319148936170213 | 1 |
| 0.8321808510638298 | 1 |
| 0.8324468085106382 | 1 |
| 0.8327127659574468 | 1 |
| 0.8329787234042554 | 1 |
| 0.8332446808510638 | 1 |
| 0.8335106382978723 | 1 |
| 0.8337765957446809 | 1 |
| 0.8340425531914893 | 1 |
| 0.8343085106382979 | 1 |
| 0.8345744680851064 | 1 |
| 0.8348404255319148 | 1 |
| 0.8351063829787234 | 1 |
| 0.8353723404255319 | 1 |
| 0.8356382978723405 | 1 |
| 0.8359042553191489 | 1 |
| 0.8361702127659575 | 1 |
| 0.836436170212766 | 1 |
| 0.8367021276595745 | 1 |
| 0.836968085106383 | 1 |
| 0.8372340425531914 | 1 |
| 0.8375 | 1 |
| 0.8377659574468085 | 1 |
| 0.8380319148936171 | 1 |
| 0.8382978723404255 | 1 |
| 0.838563829787234 | 1 |
| 0.8388297872340426 | 1 |
| 0.8390957446808511 | 1 |
| 0.8393617021276596 | 1 |
| 0.839627659574468 | 1 |
| 0.8398936170212766 | 1 |
| 0.8401595744680851 | 1 |
| 0.8404255319148937 | 1 |
| 0.8406914893617021 | 1 |
| 0.8409574468085106 | 1 |
| 0.8412234042553192 | 1 |
| 0.8414893617021276 | 1 |
| 0.8417553191489362 | 1 |
| 0.8420212765957447 | 1 |
| 0.8422872340425531 | 1 |
| 0.8425531914893617 | 1 |
| 0.8428191489361703 | 1 |
| 0.8430851063829787 | 1 |
| 0.8433510638297872 | 1 |
| 0.8436170212765958 | 1 |
| 0.8438829787234042 | 1 |
| 0.8441489361702128 | 1 |
| 0.8444148936170213 | 1 |
| 0.8446808510638297 | 1 |
| 0.8449468085106383 | 1 |
| 0.8452127659574469 | 1 |
| 0.8454787234042553 | 1 |
| 0.8457446808510638 | 1 |
| 0.8460106382978724 | 1 |
| 0.8462765957446808 | 1 |
| 0.8465425531914894 | 1 |
| 0.8468085106382979 | 1 |
| 0.8470744680851063 | 1 |
| 0.8473404255319149 | 1 |
| 0.8476063829787234 | 1 |
| 0.847872340425532 | 1 |
| 0.8481382978723404 | 1 |
| 0.8484042553191489 | 1 |
| 0.8486702127659574 | 1 |
| 0.848936170212766 | 1 |
| 0.8492021276595745 | 1 |
| 0.8494680851063829 | 1 |
| 0.8497340425531915 | 1 |
| 0.85 | 1 |
| 0.8502659574468086 | 1 |
| 0.850531914893617 | 1 |
| 0.8507978723404255 | 1 |
| 0.851063829787234 | 1 |
| 0.8513297872340425 | 1 |
| 0.8515957446808511 | 1 |
| 0.8518617021276595 | 1 |
| 0.8521276595744681 | 1 |
| 0.8523936170212766 | 1 |
| 0.8526595744680852 | 1 |
| 0.8529255319148936 | 1 |
| 0.8531914893617021 | 1 |
| 0.8534574468085107 | 1 |
| 0.8537234042553191 | 1 |
| 0.8539893617021277 | 1 |
| 0.8542553191489362 | 1 |
| 0.8545212765957446 | 1 |
| 0.8547872340425532 | 1 |
| 0.8550531914893618 | 1 |
| 0.8553191489361702 | 1 |
| 0.8555851063829787 | 1 |
| 0.8558510638297873 | 1 |
| 0.8561170212765957 | 1 |
| 0.8563829787234043 | 1 |
| 0.8566489361702128 | 1 |
| 0.8569148936170212 | 1 |
| 0.8571808510638298 | 1 |
| 0.8574468085106383 | 1 |
| 0.8577127659574468 | 1 |
| 0.8579787234042553 | 1 |
| 0.8582446808510639 | 1 |
| 0.8585106382978723 | 1 |
| 0.8587765957446809 | 1 |
| 0.8590425531914894 | 1 |
| 0.8593085106382978 | 1 |
| 0.8595744680851064 | 1 |
| 0.8598404255319149 | 1 |
| 0.8601063829787234 | 1 |
| 0.8603723404255319 | 1 |
| 0.8606382978723404 | 1 |
| 0.8609042553191489 | 1 |
| 0.8611702127659575 | 1 |
| 0.861436170212766 | 1 |
| 0.8617021276595744 | 1 |
| 0.861968085106383 | 1 |
| 0.8622340425531915 | 1 |
| 0.8625 | 1 |
| 0.8627659574468085 | 1 |
| 0.863031914893617 | 1 |
| 0.8632978723404255 | 1 |
| 0.863563829787234 | 1 |
| 0.8638297872340426 | 1 |
| 0.864095744680851 | 1 |
| 0.8643617021276596 | 1 |
| 0.8646276595744681 | 1 |
| 0.8648936170212767 | 1 |
| 0.8651595744680851 | 1 |
| 0.8654255319148936 | 1 |
| 0.8656914893617021 | 1 |
| 0.8659574468085106 | 1 |
| 0.8662234042553192 | 1 |
| 0.8664893617021276 | 1 |
| 0.8667553191489361 | 1 |
| 0.8670212765957447 | 1 |
| 0.8672872340425533 | 1 |
| 0.8675531914893617 | 1 |
| 0.8678191489361702 | 1 |
| 0.8680851063829788 | 1 |
| 0.8683510638297872 | 1 |
| 0.8686170212765958 | 1 |
| 0.8688829787234043 | 1 |
| 0.8691489361702127 | 1 |
| 0.8694148936170213 | 1 |
| 0.8696808510638298 | 1 |
| 0.8699468085106383 | 1 |
| 0.8702127659574468 | 1 |
| 0.8704787234042553 | 1 |
| 0.8707446808510638 | 1 |
| 0.8710106382978724 | 1 |
| 0.8712765957446809 | 1 |
| 0.8715425531914893 | 1 |
| 0.8718085106382979 | 1 |
| 0.8720744680851064 | 1 |
| 0.8723404255319149 | 1 |
| 0.8726063829787234 | 1 |
| 0.8728723404255319 | 1 |
| 0.8731382978723404 | 1 |
| 0.873404255319149 | 1 |
| 0.8736702127659575 | 1 |
| 0.8739361702127659 | 1 |
| 0.8742021276595745 | 1 |
| 0.874468085106383 | 1 |
| 0.8747340425531915 | 1 |
| 0.875 | 1 |
| 0.8752659574468085 | 1 |
| 0.875531914893617 | 1 |
| 0.8757978723404255 | 1 |
| 0.8760638297872341 | 1 |
| 0.8763297872340425 | 1 |
| 0.8765957446808511 | 1 |
| 0.8768617021276596 | 1 |
| 0.8771276595744681 | 1 |
| 0.8773936170212766 | 1 |
| 0.8776595744680851 | 1 |
| 0.8779255319148936 | 1 |
| 0.8781914893617021 | 1 |
| 0.8784574468085107 | 1 |
| 0.8787234042553191 | 1 |
| 0.8789893617021276 | 1 |
| 0.8792553191489362 | 1 |
| 0.8795212765957446 | 1 |
| 0.8797872340425532 | 1 |
| 0.8800531914893617 | 1 |
| 0.8803191489361702 | 1 |
| 0.8805851063829787 | 1 |
| 0.8808510638297873 | 1 |
| 0.8811170212765957 | 1 |
| 0.8813829787234042 | 1 |
| 0.8816489361702128 | 1 |
| 0.8819148936170212 | 1 |
| 0.8821808510638298 | 1 |
| 0.8824468085106383 | 1 |
| 0.8827127659574469 | 1 |
| 0.8829787234042553 | 1 |
| 0.8832446808510639 | 1 |
| 0.8835106382978724 | 1 |
| 0.8837765957446808 | 1 |
| 0.8840425531914894 | 1 |
| 0.8843085106382979 | 1 |
| 0.8845744680851064 | 1 |
| 0.8848404255319149 | 1 |
| 0.8851063829787233 | 1 |
| 0.8853723404255319 | 1 |
| 0.8856382978723404 | 1 |
| 0.885904255319149 | 1 |
| 0.8861702127659574 | 1 |
| 0.886436170212766 | 1 |
| 0.8867021276595745 | 1 |
| 0.886968085106383 | 1 |
| 0.8872340425531915 | 1 |
| 0.8875 | 1 |
| 0.8877659574468085 | 1 |
| 0.888031914893617 | 1 |
| 0.8882978723404256 | 1 |
| 0.888563829787234 | 1 |
| 0.8888297872340426 | 1 |
| 0.8890957446808511 | 1 |
| 0.8893617021276596 | 1 |
| 0.8896276595744681 | 1 |
| 0.8898936170212766 | 1 |
| 0.8901595744680851 | 1 |
| 0.8904255319148936 | 1 |
| 0.8906914893617022 | 1 |
| 0.8909574468085106 | 1 |
| 0.8912234042553191 | 1 |
| 0.8914893617021277 | 1 |
| 0.8917553191489361 | 1 |
| 0.8920212765957447 | 1 |
| 0.8922872340425532 | 1 |
| 0.8925531914893617 | 1 |
| 0.8928191489361702 | 1 |
| 0.8930851063829788 | 1 |
| 0.8933510638297872 | 1 |
| 0.8936170212765957 | 1 |
| 0.8938829787234043 | 1 |
| 0.8941489361702127 | 1 |
| 0.8944148936170213 | 1 |
| 0.8946808510638298 | 1 |
| 0.8949468085106382 | 1 |
| 0.8952127659574468 | 1 |
| 0.8954787234042553 | 1 |
| 0.8957446808510638 | 1 |
| 0.8960106382978723 | 1 |
| 0.8962765957446809 | 1 |
| 0.8965425531914893 | 1 |
| 0.8968085106382979 | 1 |
| 0.8970744680851064 | 1 |
| 0.8973404255319148 | 1 |
| 0.8976063829787234 | 1 |
| 0.8978723404255319 | 1 |
| 0.8981382978723405 | 1 |
| 0.8984042553191489 | 1 |
| 0.8986702127659575 | 1 |
| 0.898936170212766 | 1 |
| 0.8992021276595745 | 1 |
| 0.899468085106383 | 1 |
| 0.8997340425531914 | 1 |
| 0.9 | 1 |
| 0.9002659574468085 | 1 |
| 0.9005319148936171 | 1 |
| 0.9007978723404255 | 1 |
| 0.901063829787234 | 1 |
| 0.9013297872340426 | 1 |
| 0.901595744680851 | 1 |
| 0.9018617021276596 | 1 |
| 0.902127659574468 | 1 |
| 0.9023936170212766 | 1 |
| 0.9026595744680851 | 1 |
| 0.9029255319148937 | 1 |
| 0.9031914893617021 | 1 |
| 0.9034574468085106 | 1 |
| 0.9037234042553192 | 1 |
| 0.9039893617021276 | 1 |
| 0.9042553191489362 | 1 |
| 0.9045212765957447 | 1 |
| 0.9047872340425532 | 1 |
| 0.9050531914893617 | 1 |
| 0.9053191489361703 | 1 |
| 0.9055851063829787 | 1 |
| 0.9058510638297872 | 1 |
| 0.9061170212765958 | 1 |
| 0.9063829787234042 | 1 |
| 0.9066489361702128 | 1 |
| 0.9069148936170213 | 1 |
| 0.9071808510638297 | 1 |
| 0.9074468085106383 | 1 |
| 0.9077127659574468 | 1 |
| 0.9079787234042553 | 1 |
| 0.9082446808510638 | 1 |
| 0.9085106382978724 | 1 |
| 0.9087765957446808 | 1 |
| 0.9090425531914894 | 1 |
| 0.9093085106382979 | 1 |
| 0.9095744680851063 | 1 |
| 0.9098404255319149 | 1 |
| 0.9101063829787234 | 1 |
| 0.910372340425532 | 1 |
| 0.9106382978723404 | 1 |
| 0.910904255319149 | 1 |
| 0.9111702127659574 | 1 |
| 0.911436170212766 | 1 |
| 0.9117021276595745 | 1 |
| 0.9119680851063829 | 1 |
| 0.9122340425531915 | 1 |
| 0.9125 | 1 |
| 0.9127659574468086 | 1 |
| 0.913031914893617 | 1 |
| 0.9132978723404255 | 1 |
| 0.913563829787234 | 1 |
| 0.9138297872340425 | 1 |
| 0.9140957446808511 | 1 |
| 0.9143617021276595 | 1 |
| 0.9146276595744681 | 1 |
| 0.9148936170212766 | 1 |
| 0.9151595744680852 | 1 |
| 0.9154255319148936 | 1 |
| 0.9156914893617021 | 1 |
| 0.9159574468085107 | 1 |
| 0.9162234042553191 | 1 |
| 0.9164893617021277 | 1 |
| 0.9167553191489362 | 1 |
| 0.9170212765957447 | 1 |
| 0.9172872340425532 | 1 |
| 0.9175531914893618 | 1 |
| 0.9178191489361702 | 1 |
| 0.9180851063829787 | 1 |
| 0.9183510638297873 | 1 |
| 0.9186170212765957 | 1 |
| 0.9188829787234043 | 1 |
| 0.9191489361702128 | 1 |
| 0.9194148936170212 | 1 |
| 0.9196808510638298 | 1 |
| 0.9199468085106383 | 1 |
| 0.9202127659574468 | 1 |
| 0.9204787234042553 | 1 |
| 0.9207446808510639 | 1 |
| 0.9210106382978723 | 1 |
| 0.9212765957446809 | 1 |
| 0.9215425531914894 | 1 |
| 0.9218085106382978 | 1 |
| 0.9220744680851064 | 1 |
| 0.9223404255319149 | 1 |
| 0.9226063829787234 | 1 |
| 0.9228723404255319 | 1 |
| 0.9231382978723404 | 1 |
| 0.9234042553191489 | 1 |
| 0.9236702127659574 | 1 |
| 0.923936170212766 | 1 |
| 0.9242021276595744 | 1 |
| 0.924468085106383 | 1 |
| 0.9247340425531915 | 1 |
| 0.925 | 1 |
| 0.9252659574468085 | 1 |
| 0.925531914893617 | 1 |
| 0.9257978723404255 | 1 |
| 0.926063829787234 | 1 |
| 0.9263297872340426 | 1 |
| 0.926595744680851 | 1 |
| 0.9268617021276596 | 1 |
| 0.9271276595744681 | 1 |
| 0.9273936170212767 | 1 |
| 0.9276595744680851 | 1 |
| 0.9279255319148936 | 1 |
| 0.9281914893617021 | 1 |
| 0.9284574468085106 | 1 |
| 0.9287234042553192 | 1 |
| 0.9289893617021276 | 1 |
| 0.9292553191489361 | 1 |
| 0.9295212765957447 | 1 |
| 0.9297872340425531 | 1 |
| 0.9300531914893617 | 1 |
| 0.9303191489361702 | 1 |
| 0.9305851063829788 | 1 |
| 0.9308510638297872 | 1 |
| 0.9311170212765958 | 1 |
| 0.9313829787234043 | 1 |
| 0.9316489361702127 | 1 |
| 0.9319148936170213 | 1 |
| 0.9321808510638298 | 1 |
| 0.9324468085106383 | 1 |
| 0.9327127659574468 | 1 |
| 0.9329787234042554 | 1 |
| 0.9332446808510638 | 1 |
| 0.9335106382978724 | 1 |
| 0.9337765957446809 | 1 |
| 0.9340425531914893 | 1 |
| 0.9343085106382979 | 1 |
| 0.9345744680851064 | 1 |
| 0.9348404255319149 | 1 |
| 0.9351063829787234 | 1 |
| 0.9353723404255319 | 1 |
| 0.9356382978723404 | 1 |
| 0.9359042553191489 | 1 |
| 0.9361702127659575 | 1 |
| 0.9364361702127659 | 1 |
| 0.9367021276595745 | 1 |
| 0.936968085106383 | 1 |
| 0.9372340425531915 | 1 |
| 0.9375 | 1 |
| 0.9377659574468085 | 1 |
| 0.938031914893617 | 1 |
| 0.9382978723404255 | 1 |
| 0.9385638297872341 | 1 |
| 0.9388297872340425 | 1 |
| 0.9390957446808511 | 1 |
| 0.9393617021276596 | 1 |
| 0.9396276595744681 | 1 |
| 0.9398936170212766 | 1 |
| 0.9401595744680851 | 1 |
| 0.9404255319148936 | 1 |
| 0.9406914893617021 | 1 |
| 0.9409574468085107 | 1 |
| 0.9412234042553191 | 1 |
| 0.9414893617021276 | 1 |
| 0.9417553191489362 | 1 |
| 0.9420212765957446 | 1 |
| 0.9422872340425532 | 1 |
| 0.9425531914893617 | 1 |
| 0.9428191489361702 | 1 |
| 0.9430851063829787 | 1 |
| 0.9433510638297873 | 1 |
| 0.9436170212765957 | 1 |
| 0.9438829787234042 | 1 |
| 0.9441489361702128 | 1 |
| 0.9444148936170212 | 1 |
| 0.9446808510638298 | 1 |
| 0.9449468085106383 | 1 |
| 0.9452127659574469 | 1 |
| 0.9454787234042553 | 1 |
| 0.9457446808510638 | 1 |
| 0.9460106382978724 | 1 |
| 0.9462765957446808 | 1 |
| 0.9465425531914894 | 1 |
| 0.9468085106382979 | 1 |
| 0.9470744680851064 | 1 |
| 0.9473404255319149 | 1 |
| 0.9476063829787233 | 1 |
| 0.9478723404255319 | 1 |
| 0.9481382978723404 | 1 |
| 0.948404255319149 | 1 |
| 0.9486702127659574 | 1 |
| 0.948936170212766 | 1 |
| 0.9492021276595745 | 1 |
| 0.949468085106383 | 1 |
| 0.9497340425531915 | 1 |
| 0.95 | 1 |
| 0.9502659574468085 | 1 |
| 0.950531914893617 | 1 |
| 0.9507978723404256 | 1 |
| 0.951063829787234 | 1 |
| 0.9513297872340426 | 1 |
| 0.9515957446808511 | 1 |
| 0.9518617021276595 | 1 |
| 0.9521276595744681 | 1 |
| 0.9523936170212766 | 1 |
| 0.9526595744680851 | 1 |
| 0.9529255319148936 | 1 |
| 0.9531914893617022 | 1 |
| 0.9534574468085106 | 1 |
| 0.9537234042553191 | 1 |
| 0.9539893617021277 | 1 |
| 0.9542553191489361 | 1 |
| 0.9545212765957447 | 1 |
| 0.9547872340425532 | 1 |
| 0.9550531914893617 | 1 |
| 0.9553191489361702 | 1 |
| 0.9555851063829788 | 1 |
| 0.9558510638297872 | 1 |
| 0.9561170212765957 | 1 |
| 0.9563829787234043 | 1 |
| 0.9566489361702127 | 1 |
| 0.9569148936170213 | 1 |
| 0.9571808510638298 | 1 |
| 0.9574468085106383 | 1 |
| 0.9577127659574468 | 1 |
| 0.9579787234042553 | 1 |
| 0.9582446808510638 | 1 |
| 0.9585106382978723 | 1 |
| 0.9587765957446809 | 1 |
| 0.9590425531914893 | 1 |
| 0.9593085106382979 | 1 |
| 0.9595744680851064 | 1 |
| 0.9598404255319148 | 1 |
| 0.9601063829787234 | 1 |
| 0.9603723404255319 | 1 |
| 0.9606382978723405 | 1 |
| 0.9609042553191489 | 1 |
| 0.9611702127659575 | 1 |
| 0.961436170212766 | 1 |
| 0.9617021276595745 | 1 |
| 0.961968085106383 | 1 |
| 0.9622340425531914 | 1 |
| 0.9625 | 1 |
| 0.9627659574468085 | 1 |
| 0.9630319148936171 | 1 |
| 0.9632978723404255 | 1 |
| 0.9635638297872341 | 1 |
| 0.9638297872340426 | 1 |
| 0.964095744680851 | 1 |
| 0.9643617021276596 | 1 |
| 0.964627659574468 | 1 |
| 0.9648936170212766 | 1 |
| 0.9651595744680851 | 1 |
| 0.9654255319148937 | 1 |
| 0.9656914893617021 | 1 |
| 0.9659574468085106 | 1 |
| 0.9662234042553192 | 1 |
| 0.9664893617021276 | 1 |
| 0.9667553191489362 | 1 |
| 0.9670212765957447 | 1 |
| 0.9672872340425532 | 1 |
| 0.9675531914893617 | 1 |
| 0.9678191489361703 | 1 |
| 0.9680851063829787 | 1 |
| 0.9683510638297872 | 1 |
| 0.9686170212765958 | 1 |
| 0.9688829787234042 | 1 |
| 0.9691489361702128 | 1 |
| 0.9694148936170213 | 1 |
| 0.9696808510638298 | 1 |
| 0.9699468085106383 | 1 |
| 0.9702127659574468 | 1 |
| 0.9704787234042553 | 1 |
| 0.9707446808510638 | 1 |
| 0.9710106382978724 | 1 |
| 0.9712765957446808 | 1 |
| 0.9715425531914894 | 1 |
| 0.9718085106382979 | 1 |
| 0.9720744680851063 | 1 |
| 0.9723404255319149 | 1 |
| 0.9726063829787234 | 1 |
| 0.972872340425532 | 1 |
| 0.9731382978723404 | 1 |
| 0.973404255319149 | 1 |
| 0.9736702127659574 | 1 |
| 0.9739361702127659 | 1 |
| 0.9742021276595745 | 1 |
| 0.9744680851063829 | 1 |
| 0.9747340425531915 | 1 |
| 0.975 | 1 |
| 0.9752659574468086 | 1 |
| 0.975531914893617 | 1 |
| 0.9757978723404255 | 1 |
| 0.976063829787234 | 1 |
| 0.9763297872340425 | 1 |
| 0.9765957446808511 | 1 |
| 0.9768617021276595 | 1 |
| 0.9771276595744681 | 1 |
| 0.9773936170212766 | 1 |
| 0.9776595744680852 | 1 |
| 0.9779255319148936 | 1 |
| 0.9781914893617021 | 1 |
| 0.9784574468085107 | 1 |
| 0.9787234042553191 | 1 |
| 0.9789893617021277 | 1 |
| 0.9792553191489362 | 1 |
| 0.9795212765957447 | 1 |
| 0.9797872340425532 | 1 |
| 0.9800531914893617 | 1 |
| 0.9803191489361702 | 1 |
| 0.9805851063829787 | 1 |
| 0.9808510638297873 | 1 |
| 0.9811170212765957 | 1 |
| 0.9813829787234043 | 1 |
| 0.9816489361702128 | 1 |
| 0.9819148936170212 | 1 |
| 0.9821808510638298 | 1 |
| 0.9824468085106383 | 1 |
| 0.9827127659574468 | 1 |
| 0.9829787234042553 | 1 |
| 0.9832446808510639 | 1 |
| 0.9835106382978723 | 1 |
| 0.9837765957446809 | 1 |
| 0.9840425531914894 | 1 |
| 0.9843085106382978 | 1 |
| 0.9845744680851064 | 1 |
| 0.9848404255319149 | 1 |
| 0.9851063829787234 | 1 |
| 0.9853723404255319 | 1 |
| 0.9856382978723405 | 1 |
| 0.9859042553191489 | 1 |
| 0.9861702127659574 | 1 |
| 0.986436170212766 | 1 |
| 0.9867021276595744 | 1 |
| 0.986968085106383 | 1 |
| 0.9872340425531915 | 1 |
| 0.9875 | 1 |
| 0.9877659574468085 | 1 |
| 0.988031914893617 | 1 |
| 0.9882978723404255 | 1 |
| 0.988563829787234 | 1 |
| 0.9888297872340426 | 1 |
| 0.989095744680851 | 1 |
| 0.9893617021276596 | 1 |
| 0.9896276595744681 | 1 |
| 0.9898936170212767 | 1 |
| 0.9901595744680851 | 1 |
| 0.9904255319148936 | 1 |
| 0.9906914893617021 | 1 |
| 0.9909574468085106 | 1 |
| 0.9912234042553192 | 1 |
| 0.9914893617021276 | 1 |
| 0.9917553191489362 | 1 |
| 0.9920212765957447 | 1 |
| 0.9922872340425531 | 1 |
| 0.9925531914893617 | 1 |
| 0.9928191489361702 | 1 |
| 0.9930851063829788 | 1 |
| 0.9933510638297872 | 1 |
| 0.9936170212765958 | 1 |
| 0.9938829787234043 | 1 |
| 0.9941489361702127 | 1 |
| 0.9944148936170213 | 1 |
| 0.9946808510638298 | 1 |
| 0.9949468085106383 | 1 |
| 0.9952127659574468 | 1 |
| 0.9954787234042554 | 1 |
| 0.9957446808510638 | 1 |
| 0.9960106382978723 | 1 |
| 0.9962765957446809 | 1 |
| 0.9965425531914893 | 1 |
| 0.9968085106382979 | 1 |
| 0.9970744680851064 | 1 |
| 0.9973404255319149 | 1 |
| 0.9976063829787234 | 1 |
| 0.997872340425532 | 1 |
| 0.9981382978723404 | 1 |
| 0.9984042553191489 | 1 |
| 0.9986702127659575 | 1 |
| 0.9989361702127659 | 1 |
| 0.9992021276595745 | 1 |
| 0.999468085106383 | 1 |
| 0.9997340425531915 | 1 |
| 0.9997340425531915 | 1 |